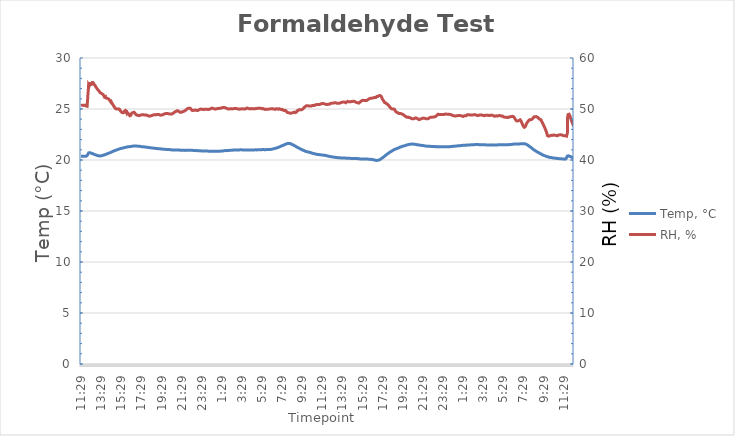
| Category | Temp, °C |
|---|---|
| 2021-06-14 11:29:58 | 20.365 |
| 2021-06-14 11:30:58 | 20.365 |
| 2021-06-14 11:31:58 | 20.341 |
| 2021-06-14 11:32:58 | 20.365 |
| 2021-06-14 11:33:58 | 20.365 |
| 2021-06-14 11:34:58 | 20.365 |
| 2021-06-14 11:35:58 | 20.365 |
| 2021-06-14 11:36:58 | 20.365 |
| 2021-06-14 11:37:58 | 20.365 |
| 2021-06-14 11:38:58 | 20.365 |
| 2021-06-14 11:39:58 | 20.365 |
| 2021-06-14 11:40:58 | 20.365 |
| 2021-06-14 11:41:58 | 20.365 |
| 2021-06-14 11:42:58 | 20.365 |
| 2021-06-14 11:43:58 | 20.365 |
| 2021-06-14 11:44:58 | 20.365 |
| 2021-06-14 11:45:58 | 20.365 |
| 2021-06-14 11:46:58 | 20.365 |
| 2021-06-14 11:47:58 | 20.365 |
| 2021-06-14 11:48:58 | 20.365 |
| 2021-06-14 11:49:58 | 20.365 |
| 2021-06-14 11:50:58 | 20.365 |
| 2021-06-14 11:51:58 | 20.365 |
| 2021-06-14 11:52:58 | 20.365 |
| 2021-06-14 11:53:58 | 20.365 |
| 2021-06-14 11:54:58 | 20.365 |
| 2021-06-14 11:55:58 | 20.365 |
| 2021-06-14 11:56:58 | 20.365 |
| 2021-06-14 11:57:58 | 20.365 |
| 2021-06-14 11:58:58 | 20.365 |
| 2021-06-14 11:59:58 | 20.365 |
| 2021-06-14 12:00:58 | 20.365 |
| 2021-06-14 12:01:58 | 20.365 |
| 2021-06-14 12:02:58 | 20.388 |
| 2021-06-14 12:03:58 | 20.388 |
| 2021-06-14 12:04:58 | 20.412 |
| 2021-06-14 12:05:58 | 20.436 |
| 2021-06-14 12:06:58 | 20.436 |
| 2021-06-14 12:07:58 | 20.46 |
| 2021-06-14 12:08:58 | 20.484 |
| 2021-06-14 12:09:58 | 20.531 |
| 2021-06-14 12:10:58 | 20.579 |
| 2021-06-14 12:11:58 | 20.603 |
| 2021-06-14 12:12:58 | 20.627 |
| 2021-06-14 12:13:58 | 20.674 |
| 2021-06-14 12:14:58 | 20.698 |
| 2021-06-14 12:15:58 | 20.722 |
| 2021-06-14 12:16:58 | 20.722 |
| 2021-06-14 12:17:58 | 20.746 |
| 2021-06-14 12:18:58 | 20.746 |
| 2021-06-14 12:19:58 | 20.746 |
| 2021-06-14 12:20:58 | 20.722 |
| 2021-06-14 12:21:58 | 20.722 |
| 2021-06-14 12:22:58 | 20.722 |
| 2021-06-14 12:23:58 | 20.722 |
| 2021-06-14 12:24:58 | 20.722 |
| 2021-06-14 12:25:58 | 20.698 |
| 2021-06-14 12:26:58 | 20.698 |
| 2021-06-14 12:27:58 | 20.698 |
| 2021-06-14 12:28:58 | 20.674 |
| 2021-06-14 12:29:58 | 20.674 |
| 2021-06-14 12:30:58 | 20.674 |
| 2021-06-14 12:31:58 | 20.65 |
| 2021-06-14 12:32:58 | 20.65 |
| 2021-06-14 12:33:58 | 20.65 |
| 2021-06-14 12:34:58 | 20.65 |
| 2021-06-14 12:35:58 | 20.627 |
| 2021-06-14 12:36:58 | 20.627 |
| 2021-06-14 12:37:58 | 20.627 |
| 2021-06-14 12:38:58 | 20.627 |
| 2021-06-14 12:39:58 | 20.603 |
| 2021-06-14 12:40:58 | 20.603 |
| 2021-06-14 12:41:58 | 20.579 |
| 2021-06-14 12:42:58 | 20.579 |
| 2021-06-14 12:43:58 | 20.579 |
| 2021-06-14 12:44:58 | 20.579 |
| 2021-06-14 12:45:58 | 20.555 |
| 2021-06-14 12:46:58 | 20.555 |
| 2021-06-14 12:47:58 | 20.555 |
| 2021-06-14 12:48:58 | 20.555 |
| 2021-06-14 12:49:58 | 20.531 |
| 2021-06-14 12:50:58 | 20.531 |
| 2021-06-14 12:51:58 | 20.531 |
| 2021-06-14 12:52:58 | 20.531 |
| 2021-06-14 12:53:58 | 20.507 |
| 2021-06-14 12:54:58 | 20.507 |
| 2021-06-14 12:55:58 | 20.507 |
| 2021-06-14 12:56:58 | 20.507 |
| 2021-06-14 12:57:58 | 20.484 |
| 2021-06-14 12:58:58 | 20.484 |
| 2021-06-14 12:59:58 | 20.484 |
| 2021-06-14 13:00:58 | 20.46 |
| 2021-06-14 13:01:58 | 20.46 |
| 2021-06-14 13:02:58 | 20.46 |
| 2021-06-14 13:03:58 | 20.46 |
| 2021-06-14 13:04:58 | 20.46 |
| 2021-06-14 13:05:58 | 20.436 |
| 2021-06-14 13:06:58 | 20.436 |
| 2021-06-14 13:07:58 | 20.436 |
| 2021-06-14 13:08:58 | 20.436 |
| 2021-06-14 13:09:58 | 20.436 |
| 2021-06-14 13:10:58 | 20.412 |
| 2021-06-14 13:11:58 | 20.412 |
| 2021-06-14 13:12:58 | 20.412 |
| 2021-06-14 13:13:58 | 20.412 |
| 2021-06-14 13:14:58 | 20.412 |
| 2021-06-14 13:15:58 | 20.412 |
| 2021-06-14 13:16:58 | 20.412 |
| 2021-06-14 13:17:58 | 20.412 |
| 2021-06-14 13:18:58 | 20.412 |
| 2021-06-14 13:19:58 | 20.412 |
| 2021-06-14 13:20:58 | 20.388 |
| 2021-06-14 13:21:58 | 20.388 |
| 2021-06-14 13:22:58 | 20.388 |
| 2021-06-14 13:23:58 | 20.388 |
| 2021-06-14 13:24:58 | 20.412 |
| 2021-06-14 13:25:58 | 20.412 |
| 2021-06-14 13:26:58 | 20.412 |
| 2021-06-14 13:27:58 | 20.412 |
| 2021-06-14 13:28:58 | 20.412 |
| 2021-06-14 13:29:58 | 20.412 |
| 2021-06-14 13:30:58 | 20.412 |
| 2021-06-14 13:31:58 | 20.412 |
| 2021-06-14 13:32:58 | 20.412 |
| 2021-06-14 13:33:58 | 20.436 |
| 2021-06-14 13:34:58 | 20.436 |
| 2021-06-14 13:35:58 | 20.436 |
| 2021-06-14 13:36:58 | 20.436 |
| 2021-06-14 13:37:58 | 20.436 |
| 2021-06-14 13:38:58 | 20.46 |
| 2021-06-14 13:39:58 | 20.46 |
| 2021-06-14 13:40:58 | 20.46 |
| 2021-06-14 13:41:58 | 20.46 |
| 2021-06-14 13:42:58 | 20.46 |
| 2021-06-14 13:43:58 | 20.484 |
| 2021-06-14 13:44:58 | 20.484 |
| 2021-06-14 13:45:58 | 20.484 |
| 2021-06-14 13:46:58 | 20.484 |
| 2021-06-14 13:47:58 | 20.507 |
| 2021-06-14 13:48:58 | 20.507 |
| 2021-06-14 13:49:58 | 20.507 |
| 2021-06-14 13:50:58 | 20.507 |
| 2021-06-14 13:51:58 | 20.507 |
| 2021-06-14 13:52:58 | 20.531 |
| 2021-06-14 13:53:58 | 20.531 |
| 2021-06-14 13:54:58 | 20.531 |
| 2021-06-14 13:55:58 | 20.531 |
| 2021-06-14 13:56:58 | 20.555 |
| 2021-06-14 13:57:58 | 20.555 |
| 2021-06-14 13:58:58 | 20.555 |
| 2021-06-14 13:59:58 | 20.555 |
| 2021-06-14 14:00:58 | 20.579 |
| 2021-06-14 14:01:58 | 20.579 |
| 2021-06-14 14:02:58 | 20.579 |
| 2021-06-14 14:03:58 | 20.603 |
| 2021-06-14 14:04:58 | 20.603 |
| 2021-06-14 14:05:58 | 20.603 |
| 2021-06-14 14:06:58 | 20.627 |
| 2021-06-14 14:07:58 | 20.627 |
| 2021-06-14 14:08:58 | 20.627 |
| 2021-06-14 14:09:58 | 20.627 |
| 2021-06-14 14:10:58 | 20.65 |
| 2021-06-14 14:11:58 | 20.65 |
| 2021-06-14 14:12:58 | 20.65 |
| 2021-06-14 14:13:58 | 20.674 |
| 2021-06-14 14:14:58 | 20.674 |
| 2021-06-14 14:15:58 | 20.674 |
| 2021-06-14 14:16:58 | 20.674 |
| 2021-06-14 14:17:58 | 20.674 |
| 2021-06-14 14:18:58 | 20.698 |
| 2021-06-14 14:19:58 | 20.698 |
| 2021-06-14 14:20:58 | 20.698 |
| 2021-06-14 14:21:58 | 20.722 |
| 2021-06-14 14:22:58 | 20.722 |
| 2021-06-14 14:23:58 | 20.722 |
| 2021-06-14 14:24:58 | 20.746 |
| 2021-06-14 14:25:58 | 20.746 |
| 2021-06-14 14:26:58 | 20.746 |
| 2021-06-14 14:27:58 | 20.746 |
| 2021-06-14 14:28:58 | 20.77 |
| 2021-06-14 14:29:58 | 20.77 |
| 2021-06-14 14:30:58 | 20.793 |
| 2021-06-14 14:31:58 | 20.793 |
| 2021-06-14 14:32:58 | 20.793 |
| 2021-06-14 14:33:58 | 20.793 |
| 2021-06-14 14:34:58 | 20.817 |
| 2021-06-14 14:35:58 | 20.817 |
| 2021-06-14 14:36:58 | 20.817 |
| 2021-06-14 14:37:58 | 20.841 |
| 2021-06-14 14:38:58 | 20.841 |
| 2021-06-14 14:39:58 | 20.841 |
| 2021-06-14 14:40:58 | 20.865 |
| 2021-06-14 14:41:58 | 20.865 |
| 2021-06-14 14:42:58 | 20.865 |
| 2021-06-14 14:43:58 | 20.865 |
| 2021-06-14 14:44:58 | 20.889 |
| 2021-06-14 14:45:58 | 20.889 |
| 2021-06-14 14:46:58 | 20.889 |
| 2021-06-14 14:47:58 | 20.889 |
| 2021-06-14 14:48:58 | 20.913 |
| 2021-06-14 14:49:58 | 20.889 |
| 2021-06-14 14:50:58 | 20.913 |
| 2021-06-14 14:51:58 | 20.936 |
| 2021-06-14 14:52:58 | 20.913 |
| 2021-06-14 14:53:58 | 20.936 |
| 2021-06-14 14:54:58 | 20.936 |
| 2021-06-14 14:55:58 | 20.936 |
| 2021-06-14 14:56:58 | 20.96 |
| 2021-06-14 14:57:58 | 20.96 |
| 2021-06-14 14:58:58 | 20.96 |
| 2021-06-14 14:59:58 | 20.96 |
| 2021-06-14 15:00:58 | 20.984 |
| 2021-06-14 15:01:58 | 20.984 |
| 2021-06-14 15:02:58 | 20.984 |
| 2021-06-14 15:03:58 | 21.008 |
| 2021-06-14 15:04:58 | 21.008 |
| 2021-06-14 15:05:58 | 21.008 |
| 2021-06-14 15:06:58 | 21.008 |
| 2021-06-14 15:07:58 | 21.032 |
| 2021-06-14 15:08:58 | 21.032 |
| 2021-06-14 15:09:58 | 21.032 |
| 2021-06-14 15:10:58 | 21.032 |
| 2021-06-14 15:11:58 | 21.032 |
| 2021-06-14 15:12:58 | 21.056 |
| 2021-06-14 15:13:58 | 21.056 |
| 2021-06-14 15:14:58 | 21.056 |
| 2021-06-14 15:15:58 | 21.079 |
| 2021-06-14 15:16:58 | 21.079 |
| 2021-06-14 15:17:58 | 21.079 |
| 2021-06-14 15:18:58 | 21.079 |
| 2021-06-14 15:19:58 | 21.103 |
| 2021-06-14 15:20:58 | 21.103 |
| 2021-06-14 15:21:58 | 21.103 |
| 2021-06-14 15:22:58 | 21.103 |
| 2021-06-14 15:23:58 | 21.127 |
| 2021-06-14 15:24:58 | 21.127 |
| 2021-06-14 15:25:58 | 21.127 |
| 2021-06-14 15:26:58 | 21.127 |
| 2021-06-14 15:27:58 | 21.127 |
| 2021-06-14 15:28:58 | 21.151 |
| 2021-06-14 15:29:58 | 21.151 |
| 2021-06-14 15:30:58 | 21.151 |
| 2021-06-14 15:31:58 | 21.151 |
| 2021-06-14 15:32:58 | 21.151 |
| 2021-06-14 15:33:58 | 21.151 |
| 2021-06-14 15:34:58 | 21.175 |
| 2021-06-14 15:35:58 | 21.175 |
| 2021-06-14 15:36:58 | 21.175 |
| 2021-06-14 15:37:58 | 21.175 |
| 2021-06-14 15:38:58 | 21.175 |
| 2021-06-14 15:39:58 | 21.199 |
| 2021-06-14 15:40:58 | 21.199 |
| 2021-06-14 15:41:58 | 21.199 |
| 2021-06-14 15:42:58 | 21.199 |
| 2021-06-14 15:43:58 | 21.199 |
| 2021-06-14 15:44:58 | 21.199 |
| 2021-06-14 15:45:58 | 21.223 |
| 2021-06-14 15:46:58 | 21.223 |
| 2021-06-14 15:47:58 | 21.223 |
| 2021-06-14 15:48:58 | 21.223 |
| 2021-06-14 15:49:58 | 21.223 |
| 2021-06-14 15:50:58 | 21.223 |
| 2021-06-14 15:51:58 | 21.223 |
| 2021-06-14 15:52:58 | 21.246 |
| 2021-06-14 15:53:58 | 21.246 |
| 2021-06-14 15:54:58 | 21.246 |
| 2021-06-14 15:55:58 | 21.246 |
| 2021-06-14 15:56:58 | 21.246 |
| 2021-06-14 15:57:58 | 21.246 |
| 2021-06-14 15:58:58 | 21.246 |
| 2021-06-14 15:59:58 | 21.27 |
| 2021-06-14 16:00:58 | 21.27 |
| 2021-06-14 16:01:58 | 21.27 |
| 2021-06-14 16:02:58 | 21.27 |
| 2021-06-14 16:03:58 | 21.27 |
| 2021-06-14 16:04:58 | 21.27 |
| 2021-06-14 16:05:58 | 21.27 |
| 2021-06-14 16:06:58 | 21.27 |
| 2021-06-14 16:07:58 | 21.27 |
| 2021-06-14 16:08:58 | 21.294 |
| 2021-06-14 16:09:58 | 21.294 |
| 2021-06-14 16:10:58 | 21.294 |
| 2021-06-14 16:11:58 | 21.294 |
| 2021-06-14 16:12:58 | 21.294 |
| 2021-06-14 16:13:58 | 21.294 |
| 2021-06-14 16:14:58 | 21.294 |
| 2021-06-14 16:15:58 | 21.294 |
| 2021-06-14 16:16:58 | 21.294 |
| 2021-06-14 16:17:58 | 21.294 |
| 2021-06-14 16:18:58 | 21.294 |
| 2021-06-14 16:19:58 | 21.294 |
| 2021-06-14 16:20:58 | 21.318 |
| 2021-06-14 16:21:58 | 21.318 |
| 2021-06-14 16:22:58 | 21.294 |
| 2021-06-14 16:23:58 | 21.318 |
| 2021-06-14 16:24:58 | 21.318 |
| 2021-06-14 16:25:58 | 21.318 |
| 2021-06-14 16:26:58 | 21.318 |
| 2021-06-14 16:27:58 | 21.318 |
| 2021-06-14 16:28:58 | 21.318 |
| 2021-06-14 16:29:58 | 21.318 |
| 2021-06-14 16:30:58 | 21.318 |
| 2021-06-14 16:31:58 | 21.318 |
| 2021-06-14 16:32:58 | 21.342 |
| 2021-06-14 16:33:58 | 21.342 |
| 2021-06-14 16:34:58 | 21.342 |
| 2021-06-14 16:35:58 | 21.342 |
| 2021-06-14 16:36:58 | 21.342 |
| 2021-06-14 16:37:58 | 21.342 |
| 2021-06-14 16:38:58 | 21.366 |
| 2021-06-14 16:39:58 | 21.366 |
| 2021-06-14 16:40:58 | 21.366 |
| 2021-06-14 16:41:58 | 21.366 |
| 2021-06-14 16:42:58 | 21.366 |
| 2021-06-14 16:43:58 | 21.366 |
| 2021-06-14 16:44:58 | 21.366 |
| 2021-06-14 16:45:58 | 21.366 |
| 2021-06-14 16:46:58 | 21.366 |
| 2021-06-14 16:47:58 | 21.366 |
| 2021-06-14 16:48:58 | 21.366 |
| 2021-06-14 16:49:58 | 21.366 |
| 2021-06-14 16:50:58 | 21.366 |
| 2021-06-14 16:51:58 | 21.366 |
| 2021-06-14 16:52:58 | 21.366 |
| 2021-06-14 16:53:58 | 21.366 |
| 2021-06-14 16:54:58 | 21.366 |
| 2021-06-14 16:55:58 | 21.366 |
| 2021-06-14 16:56:58 | 21.366 |
| 2021-06-14 16:57:58 | 21.366 |
| 2021-06-14 16:58:58 | 21.366 |
| 2021-06-14 16:59:58 | 21.366 |
| 2021-06-14 17:00:58 | 21.366 |
| 2021-06-14 17:01:58 | 21.366 |
| 2021-06-14 17:02:58 | 21.366 |
| 2021-06-14 17:03:58 | 21.366 |
| 2021-06-14 17:04:58 | 21.366 |
| 2021-06-14 17:05:58 | 21.366 |
| 2021-06-14 17:06:58 | 21.366 |
| 2021-06-14 17:07:58 | 21.366 |
| 2021-06-14 17:08:58 | 21.342 |
| 2021-06-14 17:09:58 | 21.342 |
| 2021-06-14 17:10:58 | 21.342 |
| 2021-06-14 17:11:58 | 21.342 |
| 2021-06-14 17:12:58 | 21.342 |
| 2021-06-14 17:13:58 | 21.342 |
| 2021-06-14 17:14:58 | 21.342 |
| 2021-06-14 17:15:58 | 21.342 |
| 2021-06-14 17:16:58 | 21.342 |
| 2021-06-14 17:17:58 | 21.342 |
| 2021-06-14 17:18:58 | 21.342 |
| 2021-06-14 17:19:58 | 21.342 |
| 2021-06-14 17:20:58 | 21.342 |
| 2021-06-14 17:21:58 | 21.318 |
| 2021-06-14 17:22:58 | 21.318 |
| 2021-06-14 17:23:58 | 21.318 |
| 2021-06-14 17:24:58 | 21.318 |
| 2021-06-14 17:25:58 | 21.318 |
| 2021-06-14 17:26:58 | 21.318 |
| 2021-06-14 17:27:58 | 21.318 |
| 2021-06-14 17:28:58 | 21.318 |
| 2021-06-14 17:29:58 | 21.318 |
| 2021-06-14 17:30:58 | 21.318 |
| 2021-06-14 17:31:58 | 21.318 |
| 2021-06-14 17:32:58 | 21.294 |
| 2021-06-14 17:33:58 | 21.318 |
| 2021-06-14 17:34:58 | 21.294 |
| 2021-06-14 17:35:58 | 21.294 |
| 2021-06-14 17:36:58 | 21.294 |
| 2021-06-14 17:37:58 | 21.294 |
| 2021-06-14 17:38:58 | 21.294 |
| 2021-06-14 17:39:58 | 21.294 |
| 2021-06-14 17:40:58 | 21.294 |
| 2021-06-14 17:41:58 | 21.294 |
| 2021-06-14 17:42:58 | 21.294 |
| 2021-06-14 17:43:58 | 21.294 |
| 2021-06-14 17:44:58 | 21.294 |
| 2021-06-14 17:45:58 | 21.27 |
| 2021-06-14 17:46:58 | 21.294 |
| 2021-06-14 17:47:58 | 21.27 |
| 2021-06-14 17:48:58 | 21.27 |
| 2021-06-14 17:49:58 | 21.27 |
| 2021-06-14 17:50:58 | 21.27 |
| 2021-06-14 17:51:58 | 21.27 |
| 2021-06-14 17:52:58 | 21.27 |
| 2021-06-14 17:53:58 | 21.27 |
| 2021-06-14 17:54:58 | 21.27 |
| 2021-06-14 17:55:58 | 21.246 |
| 2021-06-14 17:56:58 | 21.27 |
| 2021-06-14 17:57:58 | 21.246 |
| 2021-06-14 17:58:58 | 21.27 |
| 2021-06-14 17:59:58 | 21.246 |
| 2021-06-14 18:00:58 | 21.246 |
| 2021-06-14 18:01:58 | 21.246 |
| 2021-06-14 18:02:58 | 21.246 |
| 2021-06-14 18:03:58 | 21.246 |
| 2021-06-14 18:04:58 | 21.246 |
| 2021-06-14 18:05:58 | 21.223 |
| 2021-06-14 18:06:58 | 21.246 |
| 2021-06-14 18:07:58 | 21.246 |
| 2021-06-14 18:08:58 | 21.223 |
| 2021-06-14 18:09:58 | 21.223 |
| 2021-06-14 18:10:58 | 21.223 |
| 2021-06-14 18:11:58 | 21.223 |
| 2021-06-14 18:12:58 | 21.223 |
| 2021-06-14 18:13:58 | 21.223 |
| 2021-06-14 18:14:58 | 21.223 |
| 2021-06-14 18:15:58 | 21.223 |
| 2021-06-14 18:16:58 | 21.223 |
| 2021-06-14 18:17:58 | 21.199 |
| 2021-06-14 18:18:58 | 21.223 |
| 2021-06-14 18:19:58 | 21.199 |
| 2021-06-14 18:20:58 | 21.199 |
| 2021-06-14 18:21:58 | 21.199 |
| 2021-06-14 18:22:58 | 21.199 |
| 2021-06-14 18:23:58 | 21.199 |
| 2021-06-14 18:24:58 | 21.199 |
| 2021-06-14 18:25:58 | 21.199 |
| 2021-06-14 18:26:58 | 21.199 |
| 2021-06-14 18:27:58 | 21.175 |
| 2021-06-14 18:28:58 | 21.175 |
| 2021-06-14 18:29:58 | 21.199 |
| 2021-06-14 18:30:58 | 21.175 |
| 2021-06-14 18:31:58 | 21.175 |
| 2021-06-14 18:32:58 | 21.175 |
| 2021-06-14 18:33:58 | 21.175 |
| 2021-06-14 18:34:58 | 21.175 |
| 2021-06-14 18:35:58 | 21.175 |
| 2021-06-14 18:36:58 | 21.175 |
| 2021-06-14 18:37:58 | 21.175 |
| 2021-06-14 18:38:58 | 21.175 |
| 2021-06-14 18:39:58 | 21.151 |
| 2021-06-14 18:40:58 | 21.151 |
| 2021-06-14 18:41:58 | 21.151 |
| 2021-06-14 18:42:58 | 21.151 |
| 2021-06-14 18:43:58 | 21.151 |
| 2021-06-14 18:44:58 | 21.151 |
| 2021-06-14 18:45:58 | 21.151 |
| 2021-06-14 18:46:58 | 21.151 |
| 2021-06-14 18:47:58 | 21.151 |
| 2021-06-14 18:48:58 | 21.151 |
| 2021-06-14 18:49:58 | 21.151 |
| 2021-06-14 18:50:58 | 21.151 |
| 2021-06-14 18:51:58 | 21.151 |
| 2021-06-14 18:52:58 | 21.151 |
| 2021-06-14 18:53:58 | 21.127 |
| 2021-06-14 18:54:58 | 21.127 |
| 2021-06-14 18:55:58 | 21.127 |
| 2021-06-14 18:56:58 | 21.127 |
| 2021-06-14 18:57:58 | 21.127 |
| 2021-06-14 18:58:58 | 21.127 |
| 2021-06-14 18:59:58 | 21.127 |
| 2021-06-14 19:00:58 | 21.127 |
| 2021-06-14 19:01:58 | 21.127 |
| 2021-06-14 19:02:58 | 21.127 |
| 2021-06-14 19:03:58 | 21.127 |
| 2021-06-14 19:04:58 | 21.127 |
| 2021-06-14 19:05:58 | 21.103 |
| 2021-06-14 19:06:58 | 21.127 |
| 2021-06-14 19:07:58 | 21.103 |
| 2021-06-14 19:08:58 | 21.103 |
| 2021-06-14 19:09:58 | 21.103 |
| 2021-06-14 19:10:58 | 21.103 |
| 2021-06-14 19:11:58 | 21.103 |
| 2021-06-14 19:12:58 | 21.103 |
| 2021-06-14 19:13:58 | 21.103 |
| 2021-06-14 19:14:58 | 21.103 |
| 2021-06-14 19:15:58 | 21.103 |
| 2021-06-14 19:16:58 | 21.103 |
| 2021-06-14 19:17:58 | 21.103 |
| 2021-06-14 19:18:58 | 21.103 |
| 2021-06-14 19:19:58 | 21.079 |
| 2021-06-14 19:20:58 | 21.103 |
| 2021-06-14 19:21:58 | 21.079 |
| 2021-06-14 19:22:58 | 21.079 |
| 2021-06-14 19:23:58 | 21.079 |
| 2021-06-14 19:24:58 | 21.079 |
| 2021-06-14 19:25:58 | 21.079 |
| 2021-06-14 19:26:58 | 21.079 |
| 2021-06-14 19:27:58 | 21.079 |
| 2021-06-14 19:28:58 | 21.079 |
| 2021-06-14 19:29:58 | 21.079 |
| 2021-06-14 19:30:58 | 21.079 |
| 2021-06-14 19:31:58 | 21.079 |
| 2021-06-14 19:32:58 | 21.079 |
| 2021-06-14 19:33:58 | 21.056 |
| 2021-06-14 19:34:58 | 21.079 |
| 2021-06-14 19:35:58 | 21.056 |
| 2021-06-14 19:36:58 | 21.056 |
| 2021-06-14 19:37:58 | 21.056 |
| 2021-06-14 19:38:58 | 21.056 |
| 2021-06-14 19:39:58 | 21.056 |
| 2021-06-14 19:40:58 | 21.056 |
| 2021-06-14 19:41:58 | 21.056 |
| 2021-06-14 19:42:58 | 21.056 |
| 2021-06-14 19:43:58 | 21.056 |
| 2021-06-14 19:44:58 | 21.056 |
| 2021-06-14 19:45:58 | 21.056 |
| 2021-06-14 19:46:58 | 21.056 |
| 2021-06-14 19:47:58 | 21.056 |
| 2021-06-14 19:48:58 | 21.056 |
| 2021-06-14 19:49:58 | 21.056 |
| 2021-06-14 19:50:58 | 21.056 |
| 2021-06-14 19:51:58 | 21.032 |
| 2021-06-14 19:52:58 | 21.056 |
| 2021-06-14 19:53:58 | 21.056 |
| 2021-06-14 19:54:58 | 21.032 |
| 2021-06-14 19:55:58 | 21.032 |
| 2021-06-14 19:56:58 | 21.032 |
| 2021-06-14 19:57:58 | 21.032 |
| 2021-06-14 19:58:58 | 21.032 |
| 2021-06-14 19:59:58 | 21.032 |
| 2021-06-14 20:00:58 | 21.032 |
| 2021-06-14 20:01:58 | 21.032 |
| 2021-06-14 20:02:58 | 21.032 |
| 2021-06-14 20:03:58 | 21.032 |
| 2021-06-14 20:04:58 | 21.032 |
| 2021-06-14 20:05:58 | 21.032 |
| 2021-06-14 20:06:58 | 21.032 |
| 2021-06-14 20:07:58 | 21.032 |
| 2021-06-14 20:08:58 | 21.032 |
| 2021-06-14 20:09:58 | 21.032 |
| 2021-06-14 20:10:58 | 21.032 |
| 2021-06-14 20:11:58 | 21.032 |
| 2021-06-14 20:12:58 | 21.008 |
| 2021-06-14 20:13:58 | 21.032 |
| 2021-06-14 20:14:58 | 21.032 |
| 2021-06-14 20:15:58 | 21.008 |
| 2021-06-14 20:16:58 | 21.008 |
| 2021-06-14 20:17:58 | 21.032 |
| 2021-06-14 20:18:58 | 21.008 |
| 2021-06-14 20:19:58 | 21.008 |
| 2021-06-14 20:20:58 | 21.008 |
| 2021-06-14 20:21:58 | 21.008 |
| 2021-06-14 20:22:58 | 21.008 |
| 2021-06-14 20:23:58 | 21.008 |
| 2021-06-14 20:24:58 | 21.008 |
| 2021-06-14 20:25:58 | 21.008 |
| 2021-06-14 20:26:58 | 21.008 |
| 2021-06-14 20:27:58 | 21.008 |
| 2021-06-14 20:28:58 | 21.008 |
| 2021-06-14 20:29:58 | 21.008 |
| 2021-06-14 20:30:58 | 20.984 |
| 2021-06-14 20:31:58 | 21.008 |
| 2021-06-14 20:32:58 | 20.984 |
| 2021-06-14 20:33:58 | 20.984 |
| 2021-06-14 20:34:58 | 20.984 |
| 2021-06-14 20:35:58 | 20.984 |
| 2021-06-14 20:36:58 | 20.984 |
| 2021-06-14 20:37:58 | 20.984 |
| 2021-06-14 20:38:58 | 20.984 |
| 2021-06-14 20:39:58 | 20.984 |
| 2021-06-14 20:40:58 | 20.984 |
| 2021-06-14 20:41:58 | 20.984 |
| 2021-06-14 20:42:58 | 20.984 |
| 2021-06-14 20:43:58 | 20.984 |
| 2021-06-14 20:44:58 | 20.984 |
| 2021-06-14 20:45:58 | 20.984 |
| 2021-06-14 20:46:58 | 20.984 |
| 2021-06-14 20:47:58 | 20.984 |
| 2021-06-14 20:48:58 | 20.984 |
| 2021-06-14 20:49:58 | 20.984 |
| 2021-06-14 20:50:58 | 20.984 |
| 2021-06-14 20:51:58 | 20.984 |
| 2021-06-14 20:52:58 | 20.984 |
| 2021-06-14 20:53:58 | 20.984 |
| 2021-06-14 20:54:58 | 20.984 |
| 2021-06-14 20:55:58 | 20.984 |
| 2021-06-14 20:56:58 | 20.984 |
| 2021-06-14 20:57:58 | 20.984 |
| 2021-06-14 20:58:58 | 20.984 |
| 2021-06-14 20:59:58 | 20.984 |
| 2021-06-14 21:00:58 | 20.984 |
| 2021-06-14 21:01:58 | 20.984 |
| 2021-06-14 21:02:58 | 20.984 |
| 2021-06-14 21:03:58 | 20.984 |
| 2021-06-14 21:04:58 | 20.984 |
| 2021-06-14 21:05:58 | 20.984 |
| 2021-06-14 21:06:58 | 20.984 |
| 2021-06-14 21:07:58 | 20.984 |
| 2021-06-14 21:08:58 | 20.984 |
| 2021-06-14 21:09:58 | 20.96 |
| 2021-06-14 21:10:58 | 20.984 |
| 2021-06-14 21:11:58 | 20.984 |
| 2021-06-14 21:12:58 | 20.984 |
| 2021-06-14 21:13:58 | 20.984 |
| 2021-06-14 21:14:58 | 20.984 |
| 2021-06-14 21:15:58 | 20.984 |
| 2021-06-14 21:16:58 | 20.984 |
| 2021-06-14 21:17:58 | 20.984 |
| 2021-06-14 21:18:58 | 20.984 |
| 2021-06-14 21:19:58 | 20.96 |
| 2021-06-14 21:20:58 | 20.96 |
| 2021-06-14 21:21:58 | 20.96 |
| 2021-06-14 21:22:58 | 20.96 |
| 2021-06-14 21:23:58 | 20.96 |
| 2021-06-14 21:24:58 | 20.96 |
| 2021-06-14 21:25:58 | 20.96 |
| 2021-06-14 21:26:58 | 20.96 |
| 2021-06-14 21:27:58 | 20.96 |
| 2021-06-14 21:28:58 | 20.96 |
| 2021-06-14 21:29:58 | 20.96 |
| 2021-06-14 21:30:58 | 20.96 |
| 2021-06-14 21:31:58 | 20.96 |
| 2021-06-14 21:32:58 | 20.96 |
| 2021-06-14 21:33:58 | 20.96 |
| 2021-06-14 21:34:58 | 20.96 |
| 2021-06-14 21:35:58 | 20.96 |
| 2021-06-14 21:36:58 | 20.96 |
| 2021-06-14 21:37:58 | 20.96 |
| 2021-06-14 21:38:58 | 20.96 |
| 2021-06-14 21:39:58 | 20.96 |
| 2021-06-14 21:40:58 | 20.96 |
| 2021-06-14 21:41:58 | 20.96 |
| 2021-06-14 21:42:58 | 20.96 |
| 2021-06-14 21:43:58 | 20.96 |
| 2021-06-14 21:44:58 | 20.96 |
| 2021-06-14 21:45:58 | 20.96 |
| 2021-06-14 21:46:58 | 20.96 |
| 2021-06-14 21:47:58 | 20.96 |
| 2021-06-14 21:48:58 | 20.96 |
| 2021-06-14 21:49:58 | 20.96 |
| 2021-06-14 21:50:58 | 20.936 |
| 2021-06-14 21:51:58 | 20.96 |
| 2021-06-14 21:52:58 | 20.96 |
| 2021-06-14 21:53:58 | 20.96 |
| 2021-06-14 21:54:58 | 20.96 |
| 2021-06-14 21:55:58 | 20.96 |
| 2021-06-14 21:56:58 | 20.96 |
| 2021-06-14 21:57:58 | 20.96 |
| 2021-06-14 21:58:58 | 20.936 |
| 2021-06-14 21:59:58 | 20.96 |
| 2021-06-14 22:00:58 | 20.96 |
| 2021-06-14 22:01:58 | 20.96 |
| 2021-06-14 22:02:58 | 20.96 |
| 2021-06-14 22:03:58 | 20.96 |
| 2021-06-14 22:04:58 | 20.96 |
| 2021-06-14 22:05:58 | 20.96 |
| 2021-06-14 22:06:58 | 20.96 |
| 2021-06-14 22:07:58 | 20.96 |
| 2021-06-14 22:08:58 | 20.96 |
| 2021-06-14 22:09:58 | 20.96 |
| 2021-06-14 22:10:58 | 20.936 |
| 2021-06-14 22:11:58 | 20.96 |
| 2021-06-14 22:12:58 | 20.96 |
| 2021-06-14 22:13:58 | 20.96 |
| 2021-06-14 22:14:58 | 20.96 |
| 2021-06-14 22:15:58 | 20.96 |
| 2021-06-14 22:16:58 | 20.96 |
| 2021-06-14 22:17:58 | 20.96 |
| 2021-06-14 22:18:58 | 20.96 |
| 2021-06-14 22:19:58 | 20.96 |
| 2021-06-14 22:20:58 | 20.96 |
| 2021-06-14 22:21:58 | 20.96 |
| 2021-06-14 22:22:58 | 20.96 |
| 2021-06-14 22:23:58 | 20.96 |
| 2021-06-14 22:24:58 | 20.96 |
| 2021-06-14 22:25:58 | 20.96 |
| 2021-06-14 22:26:58 | 20.96 |
| 2021-06-14 22:27:58 | 20.96 |
| 2021-06-14 22:28:58 | 20.936 |
| 2021-06-14 22:29:58 | 20.936 |
| 2021-06-14 22:30:58 | 20.96 |
| 2021-06-14 22:31:58 | 20.96 |
| 2021-06-14 22:32:58 | 20.96 |
| 2021-06-14 22:33:58 | 20.936 |
| 2021-06-14 22:34:58 | 20.96 |
| 2021-06-14 22:35:58 | 20.936 |
| 2021-06-14 22:36:58 | 20.936 |
| 2021-06-14 22:37:58 | 20.936 |
| 2021-06-14 22:38:58 | 20.936 |
| 2021-06-14 22:39:58 | 20.936 |
| 2021-06-14 22:40:58 | 20.936 |
| 2021-06-14 22:41:58 | 20.936 |
| 2021-06-14 22:42:58 | 20.936 |
| 2021-06-14 22:43:58 | 20.936 |
| 2021-06-14 22:44:58 | 20.936 |
| 2021-06-14 22:45:58 | 20.936 |
| 2021-06-14 22:46:58 | 20.936 |
| 2021-06-14 22:47:58 | 20.936 |
| 2021-06-14 22:48:58 | 20.936 |
| 2021-06-14 22:49:58 | 20.936 |
| 2021-06-14 22:50:58 | 20.936 |
| 2021-06-14 22:51:58 | 20.936 |
| 2021-06-14 22:52:58 | 20.936 |
| 2021-06-14 22:53:58 | 20.913 |
| 2021-06-14 22:54:58 | 20.913 |
| 2021-06-14 22:55:58 | 20.913 |
| 2021-06-14 22:56:58 | 20.936 |
| 2021-06-14 22:57:58 | 20.913 |
| 2021-06-14 22:58:58 | 20.913 |
| 2021-06-14 22:59:58 | 20.913 |
| 2021-06-14 23:00:58 | 20.913 |
| 2021-06-14 23:01:58 | 20.913 |
| 2021-06-14 23:02:58 | 20.913 |
| 2021-06-14 23:03:58 | 20.913 |
| 2021-06-14 23:04:58 | 20.913 |
| 2021-06-14 23:05:58 | 20.913 |
| 2021-06-14 23:06:58 | 20.913 |
| 2021-06-14 23:07:58 | 20.913 |
| 2021-06-14 23:08:58 | 20.913 |
| 2021-06-14 23:09:58 | 20.913 |
| 2021-06-14 23:10:58 | 20.913 |
| 2021-06-14 23:11:58 | 20.913 |
| 2021-06-14 23:12:58 | 20.913 |
| 2021-06-14 23:13:58 | 20.913 |
| 2021-06-14 23:14:58 | 20.913 |
| 2021-06-14 23:15:58 | 20.913 |
| 2021-06-14 23:16:58 | 20.913 |
| 2021-06-14 23:17:58 | 20.913 |
| 2021-06-14 23:18:58 | 20.889 |
| 2021-06-14 23:19:58 | 20.913 |
| 2021-06-14 23:20:58 | 20.913 |
| 2021-06-14 23:21:58 | 20.913 |
| 2021-06-14 23:22:58 | 20.889 |
| 2021-06-14 23:23:58 | 20.889 |
| 2021-06-14 23:24:58 | 20.889 |
| 2021-06-14 23:25:58 | 20.889 |
| 2021-06-14 23:26:58 | 20.889 |
| 2021-06-14 23:27:58 | 20.889 |
| 2021-06-14 23:28:58 | 20.889 |
| 2021-06-14 23:29:58 | 20.889 |
| 2021-06-14 23:30:58 | 20.889 |
| 2021-06-14 23:31:58 | 20.889 |
| 2021-06-14 23:32:58 | 20.889 |
| 2021-06-14 23:33:58 | 20.889 |
| 2021-06-14 23:34:58 | 20.889 |
| 2021-06-14 23:35:58 | 20.889 |
| 2021-06-14 23:36:58 | 20.889 |
| 2021-06-14 23:37:58 | 20.889 |
| 2021-06-14 23:38:58 | 20.889 |
| 2021-06-14 23:39:58 | 20.889 |
| 2021-06-14 23:40:58 | 20.889 |
| 2021-06-14 23:41:58 | 20.889 |
| 2021-06-14 23:42:58 | 20.889 |
| 2021-06-14 23:43:58 | 20.889 |
| 2021-06-14 23:44:58 | 20.889 |
| 2021-06-14 23:45:58 | 20.889 |
| 2021-06-14 23:46:58 | 20.889 |
| 2021-06-14 23:47:58 | 20.889 |
| 2021-06-14 23:48:58 | 20.889 |
| 2021-06-14 23:49:58 | 20.889 |
| 2021-06-14 23:50:58 | 20.889 |
| 2021-06-14 23:51:58 | 20.889 |
| 2021-06-14 23:52:58 | 20.889 |
| 2021-06-14 23:53:58 | 20.889 |
| 2021-06-14 23:54:58 | 20.889 |
| 2021-06-14 23:55:58 | 20.865 |
| 2021-06-14 23:56:58 | 20.889 |
| 2021-06-14 23:57:58 | 20.889 |
| 2021-06-14 23:58:58 | 20.889 |
| 2021-06-14 23:59:58 | 20.889 |
| 2021-06-15 00:00:58 | 20.889 |
| 2021-06-15 00:01:58 | 20.889 |
| 2021-06-15 00:02:58 | 20.889 |
| 2021-06-15 00:03:58 | 20.889 |
| 2021-06-15 00:04:58 | 20.865 |
| 2021-06-15 00:05:58 | 20.889 |
| 2021-06-15 00:06:58 | 20.889 |
| 2021-06-15 00:07:58 | 20.865 |
| 2021-06-15 00:08:58 | 20.865 |
| 2021-06-15 00:09:58 | 20.865 |
| 2021-06-15 00:10:58 | 20.865 |
| 2021-06-15 00:11:58 | 20.865 |
| 2021-06-15 00:12:58 | 20.865 |
| 2021-06-15 00:13:58 | 20.865 |
| 2021-06-15 00:14:58 | 20.865 |
| 2021-06-15 00:15:58 | 20.865 |
| 2021-06-15 00:16:58 | 20.865 |
| 2021-06-15 00:17:58 | 20.865 |
| 2021-06-15 00:18:58 | 20.865 |
| 2021-06-15 00:19:58 | 20.865 |
| 2021-06-15 00:20:58 | 20.865 |
| 2021-06-15 00:21:58 | 20.889 |
| 2021-06-15 00:22:58 | 20.865 |
| 2021-06-15 00:23:58 | 20.865 |
| 2021-06-15 00:24:58 | 20.889 |
| 2021-06-15 00:25:58 | 20.865 |
| 2021-06-15 00:26:58 | 20.865 |
| 2021-06-15 00:27:58 | 20.865 |
| 2021-06-15 00:28:58 | 20.865 |
| 2021-06-15 00:29:58 | 20.865 |
| 2021-06-15 00:30:58 | 20.865 |
| 2021-06-15 00:31:58 | 20.889 |
| 2021-06-15 00:32:58 | 20.865 |
| 2021-06-15 00:33:58 | 20.865 |
| 2021-06-15 00:34:58 | 20.865 |
| 2021-06-15 00:35:58 | 20.865 |
| 2021-06-15 00:36:58 | 20.865 |
| 2021-06-15 00:37:58 | 20.865 |
| 2021-06-15 00:38:58 | 20.865 |
| 2021-06-15 00:39:58 | 20.865 |
| 2021-06-15 00:40:58 | 20.865 |
| 2021-06-15 00:41:58 | 20.865 |
| 2021-06-15 00:42:58 | 20.865 |
| 2021-06-15 00:43:58 | 20.865 |
| 2021-06-15 00:44:58 | 20.865 |
| 2021-06-15 00:45:58 | 20.865 |
| 2021-06-15 00:46:58 | 20.865 |
| 2021-06-15 00:47:58 | 20.865 |
| 2021-06-15 00:48:58 | 20.865 |
| 2021-06-15 00:49:58 | 20.865 |
| 2021-06-15 00:50:58 | 20.865 |
| 2021-06-15 00:51:58 | 20.865 |
| 2021-06-15 00:52:58 | 20.865 |
| 2021-06-15 00:53:58 | 20.865 |
| 2021-06-15 00:54:58 | 20.865 |
| 2021-06-15 00:55:58 | 20.865 |
| 2021-06-15 00:56:58 | 20.865 |
| 2021-06-15 00:57:58 | 20.841 |
| 2021-06-15 00:58:58 | 20.865 |
| 2021-06-15 00:59:58 | 20.865 |
| 2021-06-15 01:00:58 | 20.841 |
| 2021-06-15 01:01:58 | 20.865 |
| 2021-06-15 01:02:58 | 20.865 |
| 2021-06-15 01:03:58 | 20.865 |
| 2021-06-15 01:04:58 | 20.865 |
| 2021-06-15 01:05:58 | 20.865 |
| 2021-06-15 01:06:58 | 20.865 |
| 2021-06-15 01:07:58 | 20.865 |
| 2021-06-15 01:08:58 | 20.865 |
| 2021-06-15 01:09:58 | 20.865 |
| 2021-06-15 01:10:58 | 20.865 |
| 2021-06-15 01:11:58 | 20.865 |
| 2021-06-15 01:12:58 | 20.865 |
| 2021-06-15 01:13:58 | 20.865 |
| 2021-06-15 01:14:58 | 20.865 |
| 2021-06-15 01:15:58 | 20.865 |
| 2021-06-15 01:16:58 | 20.865 |
| 2021-06-15 01:17:58 | 20.865 |
| 2021-06-15 01:18:58 | 20.865 |
| 2021-06-15 01:19:58 | 20.865 |
| 2021-06-15 01:20:58 | 20.865 |
| 2021-06-15 01:21:58 | 20.865 |
| 2021-06-15 01:22:58 | 20.865 |
| 2021-06-15 01:23:58 | 20.865 |
| 2021-06-15 01:24:58 | 20.865 |
| 2021-06-15 01:25:58 | 20.889 |
| 2021-06-15 01:26:58 | 20.889 |
| 2021-06-15 01:27:58 | 20.889 |
| 2021-06-15 01:28:58 | 20.889 |
| 2021-06-15 01:29:58 | 20.889 |
| 2021-06-15 01:30:58 | 20.889 |
| 2021-06-15 01:31:58 | 20.889 |
| 2021-06-15 01:32:58 | 20.889 |
| 2021-06-15 01:33:58 | 20.889 |
| 2021-06-15 01:34:58 | 20.913 |
| 2021-06-15 01:35:58 | 20.889 |
| 2021-06-15 01:36:58 | 20.913 |
| 2021-06-15 01:37:58 | 20.889 |
| 2021-06-15 01:38:58 | 20.889 |
| 2021-06-15 01:39:58 | 20.889 |
| 2021-06-15 01:40:58 | 20.913 |
| 2021-06-15 01:41:58 | 20.913 |
| 2021-06-15 01:42:58 | 20.913 |
| 2021-06-15 01:43:58 | 20.913 |
| 2021-06-15 01:44:58 | 20.913 |
| 2021-06-15 01:45:58 | 20.913 |
| 2021-06-15 01:46:58 | 20.913 |
| 2021-06-15 01:47:58 | 20.913 |
| 2021-06-15 01:48:58 | 20.913 |
| 2021-06-15 01:49:58 | 20.913 |
| 2021-06-15 01:50:58 | 20.936 |
| 2021-06-15 01:51:58 | 20.913 |
| 2021-06-15 01:52:58 | 20.913 |
| 2021-06-15 01:53:58 | 20.936 |
| 2021-06-15 01:54:58 | 20.913 |
| 2021-06-15 01:55:58 | 20.936 |
| 2021-06-15 01:56:58 | 20.913 |
| 2021-06-15 01:57:58 | 20.936 |
| 2021-06-15 01:58:58 | 20.936 |
| 2021-06-15 01:59:58 | 20.936 |
| 2021-06-15 02:00:58 | 20.936 |
| 2021-06-15 02:01:58 | 20.936 |
| 2021-06-15 02:02:58 | 20.936 |
| 2021-06-15 02:03:58 | 20.936 |
| 2021-06-15 02:04:58 | 20.936 |
| 2021-06-15 02:05:58 | 20.936 |
| 2021-06-15 02:06:58 | 20.96 |
| 2021-06-15 02:07:58 | 20.936 |
| 2021-06-15 02:08:58 | 20.936 |
| 2021-06-15 02:09:58 | 20.936 |
| 2021-06-15 02:10:58 | 20.936 |
| 2021-06-15 02:11:58 | 20.936 |
| 2021-06-15 02:12:58 | 20.96 |
| 2021-06-15 02:13:58 | 20.936 |
| 2021-06-15 02:14:58 | 20.936 |
| 2021-06-15 02:15:58 | 20.936 |
| 2021-06-15 02:16:58 | 20.96 |
| 2021-06-15 02:17:58 | 20.96 |
| 2021-06-15 02:18:58 | 20.96 |
| 2021-06-15 02:19:58 | 20.96 |
| 2021-06-15 02:20:58 | 20.96 |
| 2021-06-15 02:21:58 | 20.96 |
| 2021-06-15 02:22:58 | 20.96 |
| 2021-06-15 02:23:58 | 20.96 |
| 2021-06-15 02:24:58 | 20.96 |
| 2021-06-15 02:25:58 | 20.96 |
| 2021-06-15 02:26:58 | 20.96 |
| 2021-06-15 02:27:58 | 20.96 |
| 2021-06-15 02:28:58 | 20.96 |
| 2021-06-15 02:29:58 | 20.96 |
| 2021-06-15 02:30:58 | 20.96 |
| 2021-06-15 02:31:58 | 20.96 |
| 2021-06-15 02:32:58 | 20.96 |
| 2021-06-15 02:33:58 | 20.96 |
| 2021-06-15 02:34:58 | 20.96 |
| 2021-06-15 02:35:58 | 20.96 |
| 2021-06-15 02:36:58 | 20.984 |
| 2021-06-15 02:37:58 | 20.96 |
| 2021-06-15 02:38:58 | 20.984 |
| 2021-06-15 02:39:58 | 20.96 |
| 2021-06-15 02:40:58 | 20.984 |
| 2021-06-15 02:41:58 | 20.984 |
| 2021-06-15 02:42:58 | 20.984 |
| 2021-06-15 02:43:58 | 20.984 |
| 2021-06-15 02:44:58 | 20.984 |
| 2021-06-15 02:45:58 | 20.984 |
| 2021-06-15 02:46:58 | 20.984 |
| 2021-06-15 02:47:58 | 20.984 |
| 2021-06-15 02:48:58 | 20.984 |
| 2021-06-15 02:49:58 | 20.984 |
| 2021-06-15 02:50:58 | 20.984 |
| 2021-06-15 02:51:58 | 21.008 |
| 2021-06-15 02:52:58 | 20.984 |
| 2021-06-15 02:53:58 | 20.984 |
| 2021-06-15 02:54:58 | 20.984 |
| 2021-06-15 02:55:58 | 20.984 |
| 2021-06-15 02:56:58 | 20.984 |
| 2021-06-15 02:57:58 | 20.984 |
| 2021-06-15 02:58:58 | 20.984 |
| 2021-06-15 02:59:58 | 20.984 |
| 2021-06-15 03:00:58 | 20.984 |
| 2021-06-15 03:01:58 | 20.984 |
| 2021-06-15 03:02:58 | 20.984 |
| 2021-06-15 03:03:58 | 20.984 |
| 2021-06-15 03:04:58 | 20.984 |
| 2021-06-15 03:05:58 | 20.984 |
| 2021-06-15 03:06:58 | 20.984 |
| 2021-06-15 03:07:58 | 20.984 |
| 2021-06-15 03:08:58 | 20.984 |
| 2021-06-15 03:09:58 | 20.984 |
| 2021-06-15 03:10:58 | 21.008 |
| 2021-06-15 03:11:58 | 20.984 |
| 2021-06-15 03:12:58 | 20.984 |
| 2021-06-15 03:13:58 | 20.984 |
| 2021-06-15 03:14:58 | 20.984 |
| 2021-06-15 03:15:58 | 20.984 |
| 2021-06-15 03:16:58 | 20.984 |
| 2021-06-15 03:17:58 | 20.984 |
| 2021-06-15 03:18:58 | 20.984 |
| 2021-06-15 03:19:58 | 20.984 |
| 2021-06-15 03:20:58 | 21.008 |
| 2021-06-15 03:21:58 | 20.984 |
| 2021-06-15 03:22:58 | 21.008 |
| 2021-06-15 03:23:58 | 21.008 |
| 2021-06-15 03:24:58 | 20.984 |
| 2021-06-15 03:25:58 | 21.008 |
| 2021-06-15 03:26:58 | 21.008 |
| 2021-06-15 03:27:58 | 21.008 |
| 2021-06-15 03:28:58 | 20.984 |
| 2021-06-15 03:29:58 | 21.008 |
| 2021-06-15 03:30:58 | 20.984 |
| 2021-06-15 03:31:58 | 20.984 |
| 2021-06-15 03:32:58 | 20.984 |
| 2021-06-15 03:33:58 | 20.984 |
| 2021-06-15 03:34:58 | 20.984 |
| 2021-06-15 03:35:58 | 20.984 |
| 2021-06-15 03:36:58 | 21.008 |
| 2021-06-15 03:37:58 | 21.008 |
| 2021-06-15 03:38:58 | 20.984 |
| 2021-06-15 03:39:58 | 20.984 |
| 2021-06-15 03:40:58 | 21.008 |
| 2021-06-15 03:41:58 | 21.008 |
| 2021-06-15 03:42:58 | 20.984 |
| 2021-06-15 03:43:58 | 20.984 |
| 2021-06-15 03:44:58 | 20.984 |
| 2021-06-15 03:45:58 | 20.984 |
| 2021-06-15 03:46:58 | 20.984 |
| 2021-06-15 03:47:58 | 20.984 |
| 2021-06-15 03:48:58 | 21.008 |
| 2021-06-15 03:49:58 | 20.984 |
| 2021-06-15 03:50:58 | 20.984 |
| 2021-06-15 03:51:58 | 20.984 |
| 2021-06-15 03:52:58 | 20.984 |
| 2021-06-15 03:53:58 | 20.984 |
| 2021-06-15 03:54:58 | 20.984 |
| 2021-06-15 03:55:58 | 20.984 |
| 2021-06-15 03:56:58 | 20.984 |
| 2021-06-15 03:57:58 | 20.984 |
| 2021-06-15 03:58:58 | 20.984 |
| 2021-06-15 03:59:58 | 20.984 |
| 2021-06-15 04:00:58 | 20.984 |
| 2021-06-15 04:01:58 | 20.984 |
| 2021-06-15 04:02:58 | 20.984 |
| 2021-06-15 04:03:58 | 20.984 |
| 2021-06-15 04:04:58 | 20.984 |
| 2021-06-15 04:05:58 | 20.984 |
| 2021-06-15 04:06:58 | 20.984 |
| 2021-06-15 04:07:58 | 20.984 |
| 2021-06-15 04:08:58 | 20.984 |
| 2021-06-15 04:09:58 | 20.984 |
| 2021-06-15 04:10:58 | 20.984 |
| 2021-06-15 04:11:58 | 20.984 |
| 2021-06-15 04:12:58 | 20.984 |
| 2021-06-15 04:13:58 | 20.984 |
| 2021-06-15 04:14:58 | 20.984 |
| 2021-06-15 04:15:58 | 20.984 |
| 2021-06-15 04:16:58 | 20.984 |
| 2021-06-15 04:17:58 | 20.984 |
| 2021-06-15 04:18:58 | 20.984 |
| 2021-06-15 04:19:58 | 20.984 |
| 2021-06-15 04:20:58 | 20.984 |
| 2021-06-15 04:21:58 | 20.984 |
| 2021-06-15 04:22:58 | 20.984 |
| 2021-06-15 04:23:58 | 20.984 |
| 2021-06-15 04:24:58 | 20.984 |
| 2021-06-15 04:25:58 | 20.984 |
| 2021-06-15 04:26:58 | 20.984 |
| 2021-06-15 04:27:58 | 20.984 |
| 2021-06-15 04:28:58 | 20.984 |
| 2021-06-15 04:29:58 | 20.984 |
| 2021-06-15 04:30:58 | 20.984 |
| 2021-06-15 04:31:58 | 20.984 |
| 2021-06-15 04:32:58 | 20.984 |
| 2021-06-15 04:33:58 | 20.984 |
| 2021-06-15 04:34:58 | 20.984 |
| 2021-06-15 04:35:58 | 20.984 |
| 2021-06-15 04:36:58 | 20.984 |
| 2021-06-15 04:37:58 | 20.984 |
| 2021-06-15 04:38:58 | 20.984 |
| 2021-06-15 04:39:58 | 20.984 |
| 2021-06-15 04:40:58 | 20.984 |
| 2021-06-15 04:41:58 | 20.984 |
| 2021-06-15 04:42:58 | 20.984 |
| 2021-06-15 04:43:58 | 20.984 |
| 2021-06-15 04:44:58 | 20.984 |
| 2021-06-15 04:45:58 | 20.984 |
| 2021-06-15 04:46:58 | 20.984 |
| 2021-06-15 04:47:58 | 20.984 |
| 2021-06-15 04:48:58 | 20.984 |
| 2021-06-15 04:49:58 | 20.984 |
| 2021-06-15 04:50:58 | 21.008 |
| 2021-06-15 04:51:58 | 20.984 |
| 2021-06-15 04:52:58 | 20.984 |
| 2021-06-15 04:53:58 | 20.984 |
| 2021-06-15 04:54:58 | 21.008 |
| 2021-06-15 04:55:58 | 20.984 |
| 2021-06-15 04:56:58 | 20.984 |
| 2021-06-15 04:57:58 | 20.984 |
| 2021-06-15 04:58:58 | 20.984 |
| 2021-06-15 04:59:58 | 20.984 |
| 2021-06-15 05:00:58 | 21.008 |
| 2021-06-15 05:01:58 | 20.984 |
| 2021-06-15 05:02:58 | 21.008 |
| 2021-06-15 05:03:58 | 21.008 |
| 2021-06-15 05:04:58 | 21.008 |
| 2021-06-15 05:05:58 | 21.008 |
| 2021-06-15 05:06:58 | 21.008 |
| 2021-06-15 05:07:58 | 21.008 |
| 2021-06-15 05:08:58 | 21.008 |
| 2021-06-15 05:09:58 | 21.008 |
| 2021-06-15 05:10:58 | 21.008 |
| 2021-06-15 05:11:58 | 21.008 |
| 2021-06-15 05:12:58 | 21.008 |
| 2021-06-15 05:13:58 | 21.008 |
| 2021-06-15 05:14:58 | 21.008 |
| 2021-06-15 05:15:58 | 21.008 |
| 2021-06-15 05:16:58 | 21.008 |
| 2021-06-15 05:17:58 | 21.008 |
| 2021-06-15 05:18:58 | 21.008 |
| 2021-06-15 05:19:58 | 21.008 |
| 2021-06-15 05:20:58 | 21.008 |
| 2021-06-15 05:21:58 | 21.008 |
| 2021-06-15 05:22:58 | 21.008 |
| 2021-06-15 05:23:58 | 21.032 |
| 2021-06-15 05:24:58 | 21.008 |
| 2021-06-15 05:25:58 | 21.008 |
| 2021-06-15 05:26:58 | 21.008 |
| 2021-06-15 05:27:58 | 21.008 |
| 2021-06-15 05:28:58 | 21.008 |
| 2021-06-15 05:29:58 | 21.008 |
| 2021-06-15 05:30:58 | 21.008 |
| 2021-06-15 05:31:58 | 21.008 |
| 2021-06-15 05:32:58 | 21.032 |
| 2021-06-15 05:33:58 | 21.008 |
| 2021-06-15 05:34:58 | 21.008 |
| 2021-06-15 05:35:58 | 21.008 |
| 2021-06-15 05:36:58 | 21.008 |
| 2021-06-15 05:37:58 | 21.008 |
| 2021-06-15 05:38:58 | 21.032 |
| 2021-06-15 05:39:58 | 21.032 |
| 2021-06-15 05:40:58 | 21.032 |
| 2021-06-15 05:41:58 | 21.032 |
| 2021-06-15 05:42:58 | 21.032 |
| 2021-06-15 05:43:58 | 21.032 |
| 2021-06-15 05:44:58 | 21.008 |
| 2021-06-15 05:45:58 | 21.008 |
| 2021-06-15 05:46:58 | 21.008 |
| 2021-06-15 05:47:58 | 21.032 |
| 2021-06-15 05:48:58 | 21.008 |
| 2021-06-15 05:49:58 | 21.032 |
| 2021-06-15 05:50:58 | 21.008 |
| 2021-06-15 05:51:58 | 21.008 |
| 2021-06-15 05:52:58 | 21.032 |
| 2021-06-15 05:53:58 | 21.032 |
| 2021-06-15 05:54:58 | 21.032 |
| 2021-06-15 05:55:58 | 21.032 |
| 2021-06-15 05:56:58 | 21.032 |
| 2021-06-15 05:57:58 | 21.032 |
| 2021-06-15 05:58:58 | 21.032 |
| 2021-06-15 05:59:58 | 21.008 |
| 2021-06-15 06:00:58 | 21.032 |
| 2021-06-15 06:01:58 | 21.032 |
| 2021-06-15 06:02:58 | 21.032 |
| 2021-06-15 06:03:58 | 21.032 |
| 2021-06-15 06:04:58 | 21.032 |
| 2021-06-15 06:05:58 | 21.032 |
| 2021-06-15 06:06:58 | 21.032 |
| 2021-06-15 06:07:58 | 21.032 |
| 2021-06-15 06:08:58 | 21.032 |
| 2021-06-15 06:09:58 | 21.032 |
| 2021-06-15 06:10:58 | 21.032 |
| 2021-06-15 06:11:58 | 21.032 |
| 2021-06-15 06:12:58 | 21.032 |
| 2021-06-15 06:13:58 | 21.032 |
| 2021-06-15 06:14:58 | 21.032 |
| 2021-06-15 06:15:58 | 21.032 |
| 2021-06-15 06:16:58 | 21.032 |
| 2021-06-15 06:17:58 | 21.032 |
| 2021-06-15 06:18:58 | 21.032 |
| 2021-06-15 06:19:58 | 21.032 |
| 2021-06-15 06:20:58 | 21.032 |
| 2021-06-15 06:21:58 | 21.032 |
| 2021-06-15 06:22:58 | 21.032 |
| 2021-06-15 06:23:58 | 21.032 |
| 2021-06-15 06:24:58 | 21.056 |
| 2021-06-15 06:25:58 | 21.056 |
| 2021-06-15 06:26:58 | 21.056 |
| 2021-06-15 06:27:58 | 21.056 |
| 2021-06-15 06:28:58 | 21.056 |
| 2021-06-15 06:29:58 | 21.056 |
| 2021-06-15 06:30:58 | 21.056 |
| 2021-06-15 06:31:58 | 21.079 |
| 2021-06-15 06:32:58 | 21.079 |
| 2021-06-15 06:33:58 | 21.079 |
| 2021-06-15 06:34:58 | 21.079 |
| 2021-06-15 06:35:58 | 21.079 |
| 2021-06-15 06:36:58 | 21.079 |
| 2021-06-15 06:37:58 | 21.079 |
| 2021-06-15 06:38:58 | 21.103 |
| 2021-06-15 06:39:58 | 21.103 |
| 2021-06-15 06:40:58 | 21.103 |
| 2021-06-15 06:41:58 | 21.103 |
| 2021-06-15 06:42:58 | 21.103 |
| 2021-06-15 06:43:58 | 21.127 |
| 2021-06-15 06:44:58 | 21.127 |
| 2021-06-15 06:45:58 | 21.127 |
| 2021-06-15 06:46:58 | 21.127 |
| 2021-06-15 06:47:58 | 21.127 |
| 2021-06-15 06:48:58 | 21.151 |
| 2021-06-15 06:49:58 | 21.151 |
| 2021-06-15 06:50:58 | 21.151 |
| 2021-06-15 06:51:58 | 21.151 |
| 2021-06-15 06:52:58 | 21.151 |
| 2021-06-15 06:53:58 | 21.175 |
| 2021-06-15 06:54:58 | 21.175 |
| 2021-06-15 06:55:58 | 21.175 |
| 2021-06-15 06:56:58 | 21.175 |
| 2021-06-15 06:57:58 | 21.199 |
| 2021-06-15 06:58:58 | 21.199 |
| 2021-06-15 06:59:58 | 21.199 |
| 2021-06-15 07:00:58 | 21.223 |
| 2021-06-15 07:01:58 | 21.223 |
| 2021-06-15 07:02:58 | 21.223 |
| 2021-06-15 07:03:58 | 21.246 |
| 2021-06-15 07:04:58 | 21.223 |
| 2021-06-15 07:05:58 | 21.246 |
| 2021-06-15 07:06:58 | 21.246 |
| 2021-06-15 07:07:58 | 21.246 |
| 2021-06-15 07:08:58 | 21.246 |
| 2021-06-15 07:09:58 | 21.27 |
| 2021-06-15 07:10:58 | 21.27 |
| 2021-06-15 07:11:58 | 21.27 |
| 2021-06-15 07:12:58 | 21.294 |
| 2021-06-15 07:13:58 | 21.294 |
| 2021-06-15 07:14:58 | 21.294 |
| 2021-06-15 07:15:58 | 21.294 |
| 2021-06-15 07:16:58 | 21.318 |
| 2021-06-15 07:17:58 | 21.318 |
| 2021-06-15 07:18:58 | 21.318 |
| 2021-06-15 07:19:58 | 21.318 |
| 2021-06-15 07:20:58 | 21.342 |
| 2021-06-15 07:21:58 | 21.342 |
| 2021-06-15 07:22:58 | 21.342 |
| 2021-06-15 07:23:58 | 21.366 |
| 2021-06-15 07:24:58 | 21.366 |
| 2021-06-15 07:25:58 | 21.366 |
| 2021-06-15 07:26:58 | 21.39 |
| 2021-06-15 07:27:58 | 21.39 |
| 2021-06-15 07:28:58 | 21.39 |
| 2021-06-15 07:29:58 | 21.39 |
| 2021-06-15 07:30:58 | 21.413 |
| 2021-06-15 07:31:58 | 21.413 |
| 2021-06-15 07:32:58 | 21.413 |
| 2021-06-15 07:33:58 | 21.437 |
| 2021-06-15 07:34:58 | 21.437 |
| 2021-06-15 07:35:58 | 21.437 |
| 2021-06-15 07:36:58 | 21.461 |
| 2021-06-15 07:37:58 | 21.461 |
| 2021-06-15 07:38:58 | 21.461 |
| 2021-06-15 07:39:58 | 21.461 |
| 2021-06-15 07:40:58 | 21.485 |
| 2021-06-15 07:41:58 | 21.485 |
| 2021-06-15 07:42:58 | 21.509 |
| 2021-06-15 07:43:58 | 21.509 |
| 2021-06-15 07:44:58 | 21.509 |
| 2021-06-15 07:45:58 | 21.509 |
| 2021-06-15 07:46:58 | 21.509 |
| 2021-06-15 07:47:58 | 21.533 |
| 2021-06-15 07:48:58 | 21.533 |
| 2021-06-15 07:49:58 | 21.557 |
| 2021-06-15 07:50:58 | 21.557 |
| 2021-06-15 07:51:58 | 21.557 |
| 2021-06-15 07:52:58 | 21.557 |
| 2021-06-15 07:53:58 | 21.581 |
| 2021-06-15 07:54:58 | 21.581 |
| 2021-06-15 07:55:58 | 21.581 |
| 2021-06-15 07:56:58 | 21.581 |
| 2021-06-15 07:57:58 | 21.604 |
| 2021-06-15 07:58:58 | 21.604 |
| 2021-06-15 07:59:58 | 21.604 |
| 2021-06-15 08:00:58 | 21.604 |
| 2021-06-15 08:01:58 | 21.604 |
| 2021-06-15 08:02:58 | 21.628 |
| 2021-06-15 08:03:58 | 21.628 |
| 2021-06-15 08:04:58 | 21.628 |
| 2021-06-15 08:05:58 | 21.628 |
| 2021-06-15 08:06:58 | 21.628 |
| 2021-06-15 08:07:58 | 21.628 |
| 2021-06-15 08:08:58 | 21.628 |
| 2021-06-15 08:09:58 | 21.628 |
| 2021-06-15 08:10:58 | 21.628 |
| 2021-06-15 08:11:58 | 21.628 |
| 2021-06-15 08:12:58 | 21.628 |
| 2021-06-15 08:13:58 | 21.604 |
| 2021-06-15 08:14:58 | 21.628 |
| 2021-06-15 08:15:58 | 21.604 |
| 2021-06-15 08:16:58 | 21.604 |
| 2021-06-15 08:17:58 | 21.604 |
| 2021-06-15 08:18:58 | 21.604 |
| 2021-06-15 08:19:58 | 21.581 |
| 2021-06-15 08:20:58 | 21.581 |
| 2021-06-15 08:21:58 | 21.581 |
| 2021-06-15 08:22:58 | 21.581 |
| 2021-06-15 08:23:58 | 21.581 |
| 2021-06-15 08:24:58 | 21.557 |
| 2021-06-15 08:25:58 | 21.557 |
| 2021-06-15 08:26:58 | 21.557 |
| 2021-06-15 08:27:58 | 21.533 |
| 2021-06-15 08:28:58 | 21.533 |
| 2021-06-15 08:29:58 | 21.509 |
| 2021-06-15 08:30:58 | 21.509 |
| 2021-06-15 08:31:58 | 21.509 |
| 2021-06-15 08:32:58 | 21.485 |
| 2021-06-15 08:33:58 | 21.485 |
| 2021-06-15 08:34:58 | 21.485 |
| 2021-06-15 08:35:58 | 21.461 |
| 2021-06-15 08:36:58 | 21.461 |
| 2021-06-15 08:37:58 | 21.461 |
| 2021-06-15 08:38:58 | 21.437 |
| 2021-06-15 08:39:58 | 21.437 |
| 2021-06-15 08:40:58 | 21.437 |
| 2021-06-15 08:41:58 | 21.413 |
| 2021-06-15 08:42:58 | 21.413 |
| 2021-06-15 08:43:58 | 21.39 |
| 2021-06-15 08:44:58 | 21.39 |
| 2021-06-15 08:45:58 | 21.39 |
| 2021-06-15 08:46:58 | 21.366 |
| 2021-06-15 08:47:58 | 21.366 |
| 2021-06-15 08:48:58 | 21.342 |
| 2021-06-15 08:49:58 | 21.318 |
| 2021-06-15 08:50:58 | 21.342 |
| 2021-06-15 08:51:58 | 21.318 |
| 2021-06-15 08:52:58 | 21.318 |
| 2021-06-15 08:53:58 | 21.294 |
| 2021-06-15 08:54:58 | 21.294 |
| 2021-06-15 08:55:58 | 21.294 |
| 2021-06-15 08:56:58 | 21.27 |
| 2021-06-15 08:57:58 | 21.27 |
| 2021-06-15 08:58:58 | 21.27 |
| 2021-06-15 08:59:58 | 21.27 |
| 2021-06-15 09:00:58 | 21.246 |
| 2021-06-15 09:01:58 | 21.246 |
| 2021-06-15 09:02:58 | 21.223 |
| 2021-06-15 09:03:58 | 21.223 |
| 2021-06-15 09:04:58 | 21.223 |
| 2021-06-15 09:05:58 | 21.199 |
| 2021-06-15 09:06:58 | 21.199 |
| 2021-06-15 09:07:58 | 21.199 |
| 2021-06-15 09:08:58 | 21.175 |
| 2021-06-15 09:09:58 | 21.175 |
| 2021-06-15 09:10:58 | 21.151 |
| 2021-06-15 09:11:58 | 21.151 |
| 2021-06-15 09:12:58 | 21.151 |
| 2021-06-15 09:13:58 | 21.127 |
| 2021-06-15 09:14:58 | 21.127 |
| 2021-06-15 09:15:58 | 21.127 |
| 2021-06-15 09:16:58 | 21.103 |
| 2021-06-15 09:17:58 | 21.103 |
| 2021-06-15 09:18:58 | 21.103 |
| 2021-06-15 09:19:58 | 21.079 |
| 2021-06-15 09:20:58 | 21.056 |
| 2021-06-15 09:21:58 | 21.056 |
| 2021-06-15 09:22:58 | 21.056 |
| 2021-06-15 09:23:58 | 21.032 |
| 2021-06-15 09:24:58 | 21.032 |
| 2021-06-15 09:25:58 | 21.032 |
| 2021-06-15 09:26:58 | 21.032 |
| 2021-06-15 09:27:58 | 21.008 |
| 2021-06-15 09:28:58 | 21.008 |
| 2021-06-15 09:29:58 | 21.008 |
| 2021-06-15 09:30:58 | 20.984 |
| 2021-06-15 09:31:58 | 20.984 |
| 2021-06-15 09:32:58 | 20.96 |
| 2021-06-15 09:33:58 | 20.96 |
| 2021-06-15 09:34:58 | 20.96 |
| 2021-06-15 09:35:58 | 20.96 |
| 2021-06-15 09:36:58 | 20.936 |
| 2021-06-15 09:37:58 | 20.936 |
| 2021-06-15 09:38:58 | 20.936 |
| 2021-06-15 09:39:58 | 20.913 |
| 2021-06-15 09:40:58 | 20.913 |
| 2021-06-15 09:41:58 | 20.913 |
| 2021-06-15 09:42:58 | 20.913 |
| 2021-06-15 09:43:58 | 20.889 |
| 2021-06-15 09:44:58 | 20.889 |
| 2021-06-15 09:45:58 | 20.889 |
| 2021-06-15 09:46:58 | 20.889 |
| 2021-06-15 09:47:58 | 20.889 |
| 2021-06-15 09:48:58 | 20.865 |
| 2021-06-15 09:49:58 | 20.865 |
| 2021-06-15 09:50:58 | 20.841 |
| 2021-06-15 09:51:58 | 20.841 |
| 2021-06-15 09:52:58 | 20.841 |
| 2021-06-15 09:53:58 | 20.841 |
| 2021-06-15 09:54:58 | 20.841 |
| 2021-06-15 09:55:58 | 20.841 |
| 2021-06-15 09:56:58 | 20.817 |
| 2021-06-15 09:57:58 | 20.817 |
| 2021-06-15 09:58:58 | 20.817 |
| 2021-06-15 09:59:58 | 20.817 |
| 2021-06-15 10:00:58 | 20.817 |
| 2021-06-15 10:01:58 | 20.793 |
| 2021-06-15 10:02:58 | 20.793 |
| 2021-06-15 10:03:58 | 20.793 |
| 2021-06-15 10:04:58 | 20.793 |
| 2021-06-15 10:05:58 | 20.793 |
| 2021-06-15 10:06:58 | 20.77 |
| 2021-06-15 10:07:58 | 20.77 |
| 2021-06-15 10:08:58 | 20.77 |
| 2021-06-15 10:09:58 | 20.77 |
| 2021-06-15 10:10:58 | 20.77 |
| 2021-06-15 10:11:58 | 20.746 |
| 2021-06-15 10:12:58 | 20.77 |
| 2021-06-15 10:13:58 | 20.746 |
| 2021-06-15 10:14:58 | 20.746 |
| 2021-06-15 10:15:58 | 20.746 |
| 2021-06-15 10:16:58 | 20.722 |
| 2021-06-15 10:17:58 | 20.722 |
| 2021-06-15 10:18:58 | 20.722 |
| 2021-06-15 10:19:58 | 20.722 |
| 2021-06-15 10:20:58 | 20.722 |
| 2021-06-15 10:21:58 | 20.698 |
| 2021-06-15 10:22:58 | 20.698 |
| 2021-06-15 10:23:58 | 20.698 |
| 2021-06-15 10:24:58 | 20.698 |
| 2021-06-15 10:25:58 | 20.698 |
| 2021-06-15 10:26:58 | 20.674 |
| 2021-06-15 10:27:58 | 20.674 |
| 2021-06-15 10:28:58 | 20.674 |
| 2021-06-15 10:29:58 | 20.674 |
| 2021-06-15 10:30:58 | 20.674 |
| 2021-06-15 10:31:58 | 20.674 |
| 2021-06-15 10:32:58 | 20.65 |
| 2021-06-15 10:33:58 | 20.65 |
| 2021-06-15 10:34:58 | 20.65 |
| 2021-06-15 10:35:58 | 20.65 |
| 2021-06-15 10:36:58 | 20.65 |
| 2021-06-15 10:37:58 | 20.627 |
| 2021-06-15 10:38:58 | 20.627 |
| 2021-06-15 10:39:58 | 20.627 |
| 2021-06-15 10:40:58 | 20.627 |
| 2021-06-15 10:41:58 | 20.627 |
| 2021-06-15 10:42:58 | 20.603 |
| 2021-06-15 10:43:58 | 20.603 |
| 2021-06-15 10:44:58 | 20.603 |
| 2021-06-15 10:45:58 | 20.603 |
| 2021-06-15 10:46:58 | 20.579 |
| 2021-06-15 10:47:58 | 20.579 |
| 2021-06-15 10:48:58 | 20.603 |
| 2021-06-15 10:49:58 | 20.579 |
| 2021-06-15 10:50:58 | 20.579 |
| 2021-06-15 10:51:58 | 20.579 |
| 2021-06-15 10:52:58 | 20.579 |
| 2021-06-15 10:53:58 | 20.555 |
| 2021-06-15 10:54:58 | 20.555 |
| 2021-06-15 10:55:58 | 20.555 |
| 2021-06-15 10:56:58 | 20.555 |
| 2021-06-15 10:57:58 | 20.555 |
| 2021-06-15 10:58:58 | 20.555 |
| 2021-06-15 10:59:58 | 20.531 |
| 2021-06-15 11:00:58 | 20.531 |
| 2021-06-15 11:01:58 | 20.531 |
| 2021-06-15 11:02:58 | 20.531 |
| 2021-06-15 11:03:58 | 20.531 |
| 2021-06-15 11:04:58 | 20.531 |
| 2021-06-15 11:05:58 | 20.531 |
| 2021-06-15 11:06:58 | 20.531 |
| 2021-06-15 11:07:58 | 20.531 |
| 2021-06-15 11:08:58 | 20.531 |
| 2021-06-15 11:09:58 | 20.531 |
| 2021-06-15 11:10:58 | 20.531 |
| 2021-06-15 11:11:58 | 20.507 |
| 2021-06-15 11:12:58 | 20.507 |
| 2021-06-15 11:13:58 | 20.507 |
| 2021-06-15 11:14:58 | 20.507 |
| 2021-06-15 11:15:58 | 20.507 |
| 2021-06-15 11:16:58 | 20.507 |
| 2021-06-15 11:17:58 | 20.507 |
| 2021-06-15 11:18:58 | 20.507 |
| 2021-06-15 11:19:58 | 20.507 |
| 2021-06-15 11:20:58 | 20.507 |
| 2021-06-15 11:21:58 | 20.507 |
| 2021-06-15 11:22:58 | 20.507 |
| 2021-06-15 11:23:58 | 20.507 |
| 2021-06-15 11:24:58 | 20.507 |
| 2021-06-15 11:25:58 | 20.484 |
| 2021-06-15 11:26:58 | 20.484 |
| 2021-06-15 11:27:58 | 20.484 |
| 2021-06-15 11:28:58 | 20.507 |
| 2021-06-15 11:29:58 | 20.484 |
| 2021-06-15 11:30:58 | 20.484 |
| 2021-06-15 11:31:58 | 20.484 |
| 2021-06-15 11:32:58 | 20.484 |
| 2021-06-15 11:33:58 | 20.484 |
| 2021-06-15 11:34:58 | 20.484 |
| 2021-06-15 11:35:58 | 20.484 |
| 2021-06-15 11:36:58 | 20.484 |
| 2021-06-15 11:37:58 | 20.46 |
| 2021-06-15 11:38:58 | 20.46 |
| 2021-06-15 11:39:58 | 20.46 |
| 2021-06-15 11:40:58 | 20.46 |
| 2021-06-15 11:41:58 | 20.46 |
| 2021-06-15 11:42:58 | 20.46 |
| 2021-06-15 11:43:58 | 20.46 |
| 2021-06-15 11:44:58 | 20.46 |
| 2021-06-15 11:45:58 | 20.436 |
| 2021-06-15 11:46:58 | 20.436 |
| 2021-06-15 11:47:58 | 20.436 |
| 2021-06-15 11:48:58 | 20.436 |
| 2021-06-15 11:49:58 | 20.436 |
| 2021-06-15 11:50:58 | 20.436 |
| 2021-06-15 11:51:58 | 20.436 |
| 2021-06-15 11:52:58 | 20.436 |
| 2021-06-15 11:53:58 | 20.412 |
| 2021-06-15 11:54:58 | 20.412 |
| 2021-06-15 11:55:58 | 20.412 |
| 2021-06-15 11:56:58 | 20.412 |
| 2021-06-15 11:57:58 | 20.412 |
| 2021-06-15 11:58:58 | 20.412 |
| 2021-06-15 11:59:58 | 20.388 |
| 2021-06-15 12:00:58 | 20.388 |
| 2021-06-15 12:01:58 | 20.412 |
| 2021-06-15 12:02:58 | 20.388 |
| 2021-06-15 12:03:58 | 20.388 |
| 2021-06-15 12:04:58 | 20.388 |
| 2021-06-15 12:05:58 | 20.365 |
| 2021-06-15 12:06:58 | 20.365 |
| 2021-06-15 12:07:58 | 20.365 |
| 2021-06-15 12:08:58 | 20.365 |
| 2021-06-15 12:09:58 | 20.365 |
| 2021-06-15 12:10:58 | 20.341 |
| 2021-06-15 12:11:58 | 20.341 |
| 2021-06-15 12:12:58 | 20.341 |
| 2021-06-15 12:13:58 | 20.341 |
| 2021-06-15 12:14:58 | 20.341 |
| 2021-06-15 12:15:58 | 20.341 |
| 2021-06-15 12:16:58 | 20.341 |
| 2021-06-15 12:17:58 | 20.317 |
| 2021-06-15 12:18:58 | 20.317 |
| 2021-06-15 12:19:58 | 20.317 |
| 2021-06-15 12:20:58 | 20.317 |
| 2021-06-15 12:21:58 | 20.317 |
| 2021-06-15 12:22:58 | 20.317 |
| 2021-06-15 12:23:58 | 20.317 |
| 2021-06-15 12:24:58 | 20.317 |
| 2021-06-15 12:25:58 | 20.293 |
| 2021-06-15 12:26:58 | 20.317 |
| 2021-06-15 12:27:58 | 20.293 |
| 2021-06-15 12:28:58 | 20.293 |
| 2021-06-15 12:29:58 | 20.293 |
| 2021-06-15 12:30:58 | 20.293 |
| 2021-06-15 12:31:58 | 20.293 |
| 2021-06-15 12:32:58 | 20.293 |
| 2021-06-15 12:33:58 | 20.293 |
| 2021-06-15 12:34:58 | 20.293 |
| 2021-06-15 12:35:58 | 20.293 |
| 2021-06-15 12:36:58 | 20.269 |
| 2021-06-15 12:37:58 | 20.269 |
| 2021-06-15 12:38:58 | 20.269 |
| 2021-06-15 12:39:58 | 20.269 |
| 2021-06-15 12:40:58 | 20.269 |
| 2021-06-15 12:41:58 | 20.269 |
| 2021-06-15 12:42:58 | 20.269 |
| 2021-06-15 12:43:58 | 20.269 |
| 2021-06-15 12:44:58 | 20.269 |
| 2021-06-15 12:45:58 | 20.269 |
| 2021-06-15 12:46:58 | 20.269 |
| 2021-06-15 12:47:58 | 20.269 |
| 2021-06-15 12:48:58 | 20.246 |
| 2021-06-15 12:49:58 | 20.246 |
| 2021-06-15 12:50:58 | 20.246 |
| 2021-06-15 12:51:58 | 20.246 |
| 2021-06-15 12:52:58 | 20.246 |
| 2021-06-15 12:53:58 | 20.246 |
| 2021-06-15 12:54:58 | 20.246 |
| 2021-06-15 12:55:58 | 20.246 |
| 2021-06-15 12:56:58 | 20.246 |
| 2021-06-15 12:57:58 | 20.246 |
| 2021-06-15 12:58:58 | 20.246 |
| 2021-06-15 12:59:58 | 20.246 |
| 2021-06-15 13:00:58 | 20.246 |
| 2021-06-15 13:01:58 | 20.222 |
| 2021-06-15 13:02:58 | 20.222 |
| 2021-06-15 13:03:58 | 20.222 |
| 2021-06-15 13:04:58 | 20.222 |
| 2021-06-15 13:05:58 | 20.222 |
| 2021-06-15 13:06:58 | 20.222 |
| 2021-06-15 13:07:58 | 20.222 |
| 2021-06-15 13:08:58 | 20.222 |
| 2021-06-15 13:09:58 | 20.222 |
| 2021-06-15 13:10:58 | 20.222 |
| 2021-06-15 13:11:58 | 20.222 |
| 2021-06-15 13:12:58 | 20.222 |
| 2021-06-15 13:13:58 | 20.222 |
| 2021-06-15 13:14:58 | 20.222 |
| 2021-06-15 13:15:58 | 20.222 |
| 2021-06-15 13:16:58 | 20.198 |
| 2021-06-15 13:17:58 | 20.222 |
| 2021-06-15 13:18:58 | 20.198 |
| 2021-06-15 13:19:58 | 20.198 |
| 2021-06-15 13:20:58 | 20.198 |
| 2021-06-15 13:21:58 | 20.198 |
| 2021-06-15 13:22:58 | 20.198 |
| 2021-06-15 13:23:58 | 20.198 |
| 2021-06-15 13:24:58 | 20.198 |
| 2021-06-15 13:25:58 | 20.198 |
| 2021-06-15 13:26:58 | 20.198 |
| 2021-06-15 13:27:58 | 20.198 |
| 2021-06-15 13:28:58 | 20.198 |
| 2021-06-15 13:29:58 | 20.198 |
| 2021-06-15 13:30:58 | 20.198 |
| 2021-06-15 13:31:58 | 20.198 |
| 2021-06-15 13:32:58 | 20.198 |
| 2021-06-15 13:33:58 | 20.198 |
| 2021-06-15 13:34:58 | 20.198 |
| 2021-06-15 13:35:58 | 20.198 |
| 2021-06-15 13:36:58 | 20.198 |
| 2021-06-15 13:37:58 | 20.174 |
| 2021-06-15 13:38:58 | 20.198 |
| 2021-06-15 13:39:58 | 20.198 |
| 2021-06-15 13:40:58 | 20.198 |
| 2021-06-15 13:41:58 | 20.174 |
| 2021-06-15 13:42:58 | 20.174 |
| 2021-06-15 13:43:58 | 20.174 |
| 2021-06-15 13:44:58 | 20.198 |
| 2021-06-15 13:45:58 | 20.174 |
| 2021-06-15 13:46:58 | 20.174 |
| 2021-06-15 13:47:58 | 20.174 |
| 2021-06-15 13:48:58 | 20.174 |
| 2021-06-15 13:49:58 | 20.174 |
| 2021-06-15 13:50:58 | 20.174 |
| 2021-06-15 13:51:58 | 20.174 |
| 2021-06-15 13:52:58 | 20.174 |
| 2021-06-15 13:53:58 | 20.174 |
| 2021-06-15 13:54:58 | 20.174 |
| 2021-06-15 13:55:58 | 20.174 |
| 2021-06-15 13:56:58 | 20.174 |
| 2021-06-15 13:57:58 | 20.174 |
| 2021-06-15 13:58:58 | 20.174 |
| 2021-06-15 13:59:58 | 20.174 |
| 2021-06-15 14:00:58 | 20.174 |
| 2021-06-15 14:01:58 | 20.174 |
| 2021-06-15 14:02:58 | 20.174 |
| 2021-06-15 14:03:58 | 20.174 |
| 2021-06-15 14:04:58 | 20.174 |
| 2021-06-15 14:05:58 | 20.174 |
| 2021-06-15 14:06:58 | 20.174 |
| 2021-06-15 14:07:58 | 20.174 |
| 2021-06-15 14:08:58 | 20.174 |
| 2021-06-15 14:09:58 | 20.174 |
| 2021-06-15 14:10:58 | 20.174 |
| 2021-06-15 14:11:58 | 20.174 |
| 2021-06-15 14:12:58 | 20.15 |
| 2021-06-15 14:13:58 | 20.174 |
| 2021-06-15 14:14:58 | 20.174 |
| 2021-06-15 14:15:58 | 20.174 |
| 2021-06-15 14:16:58 | 20.15 |
| 2021-06-15 14:17:58 | 20.174 |
| 2021-06-15 14:18:58 | 20.15 |
| 2021-06-15 14:19:58 | 20.15 |
| 2021-06-15 14:20:58 | 20.15 |
| 2021-06-15 14:21:58 | 20.15 |
| 2021-06-15 14:22:58 | 20.15 |
| 2021-06-15 14:23:58 | 20.15 |
| 2021-06-15 14:24:58 | 20.15 |
| 2021-06-15 14:25:58 | 20.15 |
| 2021-06-15 14:26:58 | 20.15 |
| 2021-06-15 14:27:58 | 20.15 |
| 2021-06-15 14:28:58 | 20.15 |
| 2021-06-15 14:29:58 | 20.15 |
| 2021-06-15 14:30:58 | 20.15 |
| 2021-06-15 14:31:58 | 20.15 |
| 2021-06-15 14:32:58 | 20.15 |
| 2021-06-15 14:33:58 | 20.15 |
| 2021-06-15 14:34:58 | 20.15 |
| 2021-06-15 14:35:58 | 20.15 |
| 2021-06-15 14:36:58 | 20.15 |
| 2021-06-15 14:37:58 | 20.15 |
| 2021-06-15 14:38:58 | 20.15 |
| 2021-06-15 14:39:58 | 20.15 |
| 2021-06-15 14:40:58 | 20.15 |
| 2021-06-15 14:41:58 | 20.15 |
| 2021-06-15 14:42:58 | 20.15 |
| 2021-06-15 14:43:58 | 20.15 |
| 2021-06-15 14:44:58 | 20.15 |
| 2021-06-15 14:45:58 | 20.15 |
| 2021-06-15 14:46:58 | 20.15 |
| 2021-06-15 14:47:58 | 20.15 |
| 2021-06-15 14:48:58 | 20.15 |
| 2021-06-15 14:49:58 | 20.15 |
| 2021-06-15 14:50:58 | 20.15 |
| 2021-06-15 14:51:58 | 20.15 |
| 2021-06-15 14:52:58 | 20.15 |
| 2021-06-15 14:53:58 | 20.15 |
| 2021-06-15 14:54:58 | 20.15 |
| 2021-06-15 14:55:58 | 20.126 |
| 2021-06-15 14:56:58 | 20.15 |
| 2021-06-15 14:57:58 | 20.15 |
| 2021-06-15 14:58:58 | 20.126 |
| 2021-06-15 14:59:58 | 20.15 |
| 2021-06-15 15:00:58 | 20.15 |
| 2021-06-15 15:01:58 | 20.126 |
| 2021-06-15 15:02:58 | 20.126 |
| 2021-06-15 15:03:58 | 20.126 |
| 2021-06-15 15:04:58 | 20.126 |
| 2021-06-15 15:05:58 | 20.126 |
| 2021-06-15 15:06:58 | 20.126 |
| 2021-06-15 15:07:58 | 20.126 |
| 2021-06-15 15:08:58 | 20.126 |
| 2021-06-15 15:09:58 | 20.103 |
| 2021-06-15 15:10:58 | 20.103 |
| 2021-06-15 15:11:58 | 20.103 |
| 2021-06-15 15:12:58 | 20.103 |
| 2021-06-15 15:13:58 | 20.103 |
| 2021-06-15 15:14:58 | 20.103 |
| 2021-06-15 15:15:58 | 20.103 |
| 2021-06-15 15:16:58 | 20.103 |
| 2021-06-15 15:17:58 | 20.103 |
| 2021-06-15 15:18:58 | 20.103 |
| 2021-06-15 15:19:58 | 20.103 |
| 2021-06-15 15:20:58 | 20.103 |
| 2021-06-15 15:21:58 | 20.103 |
| 2021-06-15 15:22:58 | 20.103 |
| 2021-06-15 15:23:58 | 20.103 |
| 2021-06-15 15:24:58 | 20.103 |
| 2021-06-15 15:25:58 | 20.103 |
| 2021-06-15 15:26:58 | 20.103 |
| 2021-06-15 15:27:58 | 20.103 |
| 2021-06-15 15:28:58 | 20.103 |
| 2021-06-15 15:29:58 | 20.103 |
| 2021-06-15 15:30:58 | 20.103 |
| 2021-06-15 15:31:58 | 20.103 |
| 2021-06-15 15:32:58 | 20.103 |
| 2021-06-15 15:33:58 | 20.103 |
| 2021-06-15 15:34:58 | 20.103 |
| 2021-06-15 15:35:58 | 20.103 |
| 2021-06-15 15:36:58 | 20.103 |
| 2021-06-15 15:37:58 | 20.103 |
| 2021-06-15 15:38:58 | 20.103 |
| 2021-06-15 15:39:58 | 20.103 |
| 2021-06-15 15:40:58 | 20.103 |
| 2021-06-15 15:41:58 | 20.103 |
| 2021-06-15 15:42:58 | 20.103 |
| 2021-06-15 15:43:58 | 20.103 |
| 2021-06-15 15:44:58 | 20.103 |
| 2021-06-15 15:45:58 | 20.103 |
| 2021-06-15 15:46:58 | 20.103 |
| 2021-06-15 15:47:58 | 20.103 |
| 2021-06-15 15:48:58 | 20.103 |
| 2021-06-15 15:49:58 | 20.103 |
| 2021-06-15 15:50:58 | 20.103 |
| 2021-06-15 15:51:58 | 20.103 |
| 2021-06-15 15:52:58 | 20.103 |
| 2021-06-15 15:53:58 | 20.103 |
| 2021-06-15 15:54:58 | 20.103 |
| 2021-06-15 15:55:58 | 20.103 |
| 2021-06-15 15:56:58 | 20.103 |
| 2021-06-15 15:57:58 | 20.079 |
| 2021-06-15 15:58:58 | 20.103 |
| 2021-06-15 15:59:58 | 20.079 |
| 2021-06-15 16:00:58 | 20.079 |
| 2021-06-15 16:01:58 | 20.079 |
| 2021-06-15 16:02:58 | 20.079 |
| 2021-06-15 16:03:58 | 20.079 |
| 2021-06-15 16:04:58 | 20.079 |
| 2021-06-15 16:05:58 | 20.079 |
| 2021-06-15 16:06:58 | 20.079 |
| 2021-06-15 16:07:58 | 20.079 |
| 2021-06-15 16:08:58 | 20.079 |
| 2021-06-15 16:09:58 | 20.079 |
| 2021-06-15 16:10:58 | 20.079 |
| 2021-06-15 16:11:58 | 20.079 |
| 2021-06-15 16:12:58 | 20.079 |
| 2021-06-15 16:13:58 | 20.079 |
| 2021-06-15 16:14:58 | 20.079 |
| 2021-06-15 16:15:58 | 20.055 |
| 2021-06-15 16:16:58 | 20.055 |
| 2021-06-15 16:17:58 | 20.055 |
| 2021-06-15 16:18:58 | 20.055 |
| 2021-06-15 16:19:58 | 20.055 |
| 2021-06-15 16:20:58 | 20.055 |
| 2021-06-15 16:21:58 | 20.055 |
| 2021-06-15 16:22:58 | 20.055 |
| 2021-06-15 16:23:58 | 20.055 |
| 2021-06-15 16:24:58 | 20.055 |
| 2021-06-15 16:25:58 | 20.055 |
| 2021-06-15 16:26:58 | 20.055 |
| 2021-06-15 16:27:58 | 20.055 |
| 2021-06-15 16:28:58 | 20.055 |
| 2021-06-15 16:29:58 | 20.031 |
| 2021-06-15 16:30:58 | 20.031 |
| 2021-06-15 16:31:58 | 20.031 |
| 2021-06-15 16:32:58 | 20.031 |
| 2021-06-15 16:33:58 | 20.031 |
| 2021-06-15 16:34:58 | 20.031 |
| 2021-06-15 16:35:58 | 20.031 |
| 2021-06-15 16:36:58 | 20.007 |
| 2021-06-15 16:37:58 | 20.007 |
| 2021-06-15 16:38:58 | 20.007 |
| 2021-06-15 16:39:58 | 20.007 |
| 2021-06-15 16:40:58 | 20.007 |
| 2021-06-15 16:41:58 | 20.007 |
| 2021-06-15 16:42:58 | 19.984 |
| 2021-06-15 16:43:58 | 19.984 |
| 2021-06-15 16:44:58 | 19.984 |
| 2021-06-15 16:45:58 | 19.984 |
| 2021-06-15 16:46:58 | 19.96 |
| 2021-06-15 16:47:58 | 19.96 |
| 2021-06-15 16:48:58 | 19.96 |
| 2021-06-15 16:49:58 | 19.96 |
| 2021-06-15 16:50:58 | 19.96 |
| 2021-06-15 16:51:58 | 19.96 |
| 2021-06-15 16:52:58 | 19.96 |
| 2021-06-15 16:53:58 | 19.96 |
| 2021-06-15 16:54:58 | 19.96 |
| 2021-06-15 16:55:58 | 19.96 |
| 2021-06-15 16:56:58 | 19.96 |
| 2021-06-15 16:57:58 | 19.96 |
| 2021-06-15 16:58:58 | 19.96 |
| 2021-06-15 16:59:58 | 19.96 |
| 2021-06-15 17:00:58 | 19.96 |
| 2021-06-15 17:01:58 | 19.96 |
| 2021-06-15 17:02:58 | 19.984 |
| 2021-06-15 17:03:58 | 19.984 |
| 2021-06-15 17:04:58 | 19.984 |
| 2021-06-15 17:05:58 | 19.984 |
| 2021-06-15 17:06:58 | 20.007 |
| 2021-06-15 17:07:58 | 20.007 |
| 2021-06-15 17:08:58 | 20.007 |
| 2021-06-15 17:09:58 | 20.031 |
| 2021-06-15 17:10:58 | 20.031 |
| 2021-06-15 17:11:58 | 20.031 |
| 2021-06-15 17:12:58 | 20.055 |
| 2021-06-15 17:13:58 | 20.055 |
| 2021-06-15 17:14:58 | 20.055 |
| 2021-06-15 17:15:58 | 20.079 |
| 2021-06-15 17:16:58 | 20.079 |
| 2021-06-15 17:17:58 | 20.103 |
| 2021-06-15 17:18:58 | 20.103 |
| 2021-06-15 17:19:58 | 20.126 |
| 2021-06-15 17:20:58 | 20.126 |
| 2021-06-15 17:21:58 | 20.15 |
| 2021-06-15 17:22:58 | 20.15 |
| 2021-06-15 17:23:58 | 20.174 |
| 2021-06-15 17:24:58 | 20.174 |
| 2021-06-15 17:25:58 | 20.174 |
| 2021-06-15 17:26:58 | 20.198 |
| 2021-06-15 17:27:58 | 20.222 |
| 2021-06-15 17:28:58 | 20.222 |
| 2021-06-15 17:29:58 | 20.222 |
| 2021-06-15 17:30:58 | 20.246 |
| 2021-06-15 17:31:58 | 20.269 |
| 2021-06-15 17:32:58 | 20.269 |
| 2021-06-15 17:33:58 | 20.293 |
| 2021-06-15 17:34:58 | 20.293 |
| 2021-06-15 17:35:58 | 20.317 |
| 2021-06-15 17:36:58 | 20.317 |
| 2021-06-15 17:37:58 | 20.341 |
| 2021-06-15 17:38:58 | 20.341 |
| 2021-06-15 17:39:58 | 20.365 |
| 2021-06-15 17:40:58 | 20.365 |
| 2021-06-15 17:41:58 | 20.388 |
| 2021-06-15 17:42:58 | 20.412 |
| 2021-06-15 17:43:58 | 20.412 |
| 2021-06-15 17:44:58 | 20.436 |
| 2021-06-15 17:45:58 | 20.436 |
| 2021-06-15 17:46:58 | 20.46 |
| 2021-06-15 17:47:58 | 20.46 |
| 2021-06-15 17:48:58 | 20.484 |
| 2021-06-15 17:49:58 | 20.484 |
| 2021-06-15 17:50:58 | 20.507 |
| 2021-06-15 17:51:58 | 20.507 |
| 2021-06-15 17:52:58 | 20.531 |
| 2021-06-15 17:53:58 | 20.531 |
| 2021-06-15 17:54:58 | 20.555 |
| 2021-06-15 17:55:58 | 20.579 |
| 2021-06-15 17:56:58 | 20.579 |
| 2021-06-15 17:57:58 | 20.579 |
| 2021-06-15 17:58:58 | 20.603 |
| 2021-06-15 17:59:58 | 20.627 |
| 2021-06-15 18:00:58 | 20.627 |
| 2021-06-15 18:01:58 | 20.65 |
| 2021-06-15 18:02:58 | 20.65 |
| 2021-06-15 18:03:58 | 20.674 |
| 2021-06-15 18:04:58 | 20.674 |
| 2021-06-15 18:05:58 | 20.674 |
| 2021-06-15 18:06:58 | 20.698 |
| 2021-06-15 18:07:58 | 20.722 |
| 2021-06-15 18:08:58 | 20.722 |
| 2021-06-15 18:09:58 | 20.722 |
| 2021-06-15 18:10:58 | 20.746 |
| 2021-06-15 18:11:58 | 20.746 |
| 2021-06-15 18:12:58 | 20.77 |
| 2021-06-15 18:13:58 | 20.77 |
| 2021-06-15 18:14:58 | 20.793 |
| 2021-06-15 18:15:58 | 20.793 |
| 2021-06-15 18:16:58 | 20.817 |
| 2021-06-15 18:17:58 | 20.817 |
| 2021-06-15 18:18:58 | 20.817 |
| 2021-06-15 18:19:58 | 20.841 |
| 2021-06-15 18:20:58 | 20.841 |
| 2021-06-15 18:21:58 | 20.865 |
| 2021-06-15 18:22:58 | 20.865 |
| 2021-06-15 18:23:58 | 20.889 |
| 2021-06-15 18:24:58 | 20.889 |
| 2021-06-15 18:25:58 | 20.889 |
| 2021-06-15 18:26:58 | 20.913 |
| 2021-06-15 18:27:58 | 20.913 |
| 2021-06-15 18:28:58 | 20.936 |
| 2021-06-15 18:29:58 | 20.936 |
| 2021-06-15 18:30:58 | 20.96 |
| 2021-06-15 18:31:58 | 20.96 |
| 2021-06-15 18:32:58 | 20.96 |
| 2021-06-15 18:33:58 | 20.984 |
| 2021-06-15 18:34:58 | 20.984 |
| 2021-06-15 18:35:58 | 20.984 |
| 2021-06-15 18:36:58 | 21.008 |
| 2021-06-15 18:37:58 | 21.008 |
| 2021-06-15 18:38:58 | 21.032 |
| 2021-06-15 18:39:58 | 21.032 |
| 2021-06-15 18:40:58 | 21.032 |
| 2021-06-15 18:41:58 | 21.032 |
| 2021-06-15 18:42:58 | 21.056 |
| 2021-06-15 18:43:58 | 21.056 |
| 2021-06-15 18:44:58 | 21.056 |
| 2021-06-15 18:45:58 | 21.079 |
| 2021-06-15 18:46:58 | 21.079 |
| 2021-06-15 18:47:58 | 21.103 |
| 2021-06-15 18:48:58 | 21.103 |
| 2021-06-15 18:49:58 | 21.103 |
| 2021-06-15 18:50:58 | 21.103 |
| 2021-06-15 18:51:58 | 21.127 |
| 2021-06-15 18:52:58 | 21.127 |
| 2021-06-15 18:53:58 | 21.127 |
| 2021-06-15 18:54:58 | 21.151 |
| 2021-06-15 18:55:58 | 21.151 |
| 2021-06-15 18:56:58 | 21.151 |
| 2021-06-15 18:57:58 | 21.151 |
| 2021-06-15 18:58:58 | 21.175 |
| 2021-06-15 18:59:58 | 21.175 |
| 2021-06-15 19:00:58 | 21.175 |
| 2021-06-15 19:01:58 | 21.199 |
| 2021-06-15 19:02:58 | 21.175 |
| 2021-06-15 19:03:58 | 21.199 |
| 2021-06-15 19:04:58 | 21.199 |
| 2021-06-15 19:05:58 | 21.223 |
| 2021-06-15 19:06:58 | 21.223 |
| 2021-06-15 19:07:58 | 21.223 |
| 2021-06-15 19:08:58 | 21.223 |
| 2021-06-15 19:09:58 | 21.246 |
| 2021-06-15 19:10:58 | 21.246 |
| 2021-06-15 19:11:58 | 21.246 |
| 2021-06-15 19:12:58 | 21.246 |
| 2021-06-15 19:13:58 | 21.27 |
| 2021-06-15 19:14:58 | 21.27 |
| 2021-06-15 19:15:58 | 21.27 |
| 2021-06-15 19:16:58 | 21.294 |
| 2021-06-15 19:17:58 | 21.294 |
| 2021-06-15 19:18:58 | 21.294 |
| 2021-06-15 19:19:58 | 21.294 |
| 2021-06-15 19:20:58 | 21.294 |
| 2021-06-15 19:21:58 | 21.318 |
| 2021-06-15 19:22:58 | 21.318 |
| 2021-06-15 19:23:58 | 21.318 |
| 2021-06-15 19:24:58 | 21.318 |
| 2021-06-15 19:25:58 | 21.342 |
| 2021-06-15 19:26:58 | 21.342 |
| 2021-06-15 19:27:58 | 21.342 |
| 2021-06-15 19:28:58 | 21.366 |
| 2021-06-15 19:29:58 | 21.366 |
| 2021-06-15 19:30:58 | 21.366 |
| 2021-06-15 19:31:58 | 21.366 |
| 2021-06-15 19:32:58 | 21.366 |
| 2021-06-15 19:33:58 | 21.366 |
| 2021-06-15 19:34:58 | 21.39 |
| 2021-06-15 19:35:58 | 21.39 |
| 2021-06-15 19:36:58 | 21.39 |
| 2021-06-15 19:37:58 | 21.39 |
| 2021-06-15 19:38:58 | 21.39 |
| 2021-06-15 19:39:58 | 21.413 |
| 2021-06-15 19:40:58 | 21.413 |
| 2021-06-15 19:41:58 | 21.413 |
| 2021-06-15 19:42:58 | 21.413 |
| 2021-06-15 19:43:58 | 21.437 |
| 2021-06-15 19:44:58 | 21.413 |
| 2021-06-15 19:45:58 | 21.437 |
| 2021-06-15 19:46:58 | 21.437 |
| 2021-06-15 19:47:58 | 21.437 |
| 2021-06-15 19:48:58 | 21.437 |
| 2021-06-15 19:49:58 | 21.437 |
| 2021-06-15 19:50:58 | 21.461 |
| 2021-06-15 19:51:58 | 21.461 |
| 2021-06-15 19:52:58 | 21.461 |
| 2021-06-15 19:53:58 | 21.461 |
| 2021-06-15 19:54:58 | 21.461 |
| 2021-06-15 19:55:58 | 21.485 |
| 2021-06-15 19:56:58 | 21.485 |
| 2021-06-15 19:57:58 | 21.485 |
| 2021-06-15 19:58:58 | 21.485 |
| 2021-06-15 19:59:58 | 21.485 |
| 2021-06-15 20:00:58 | 21.485 |
| 2021-06-15 20:01:58 | 21.485 |
| 2021-06-15 20:02:58 | 21.509 |
| 2021-06-15 20:03:58 | 21.509 |
| 2021-06-15 20:04:58 | 21.509 |
| 2021-06-15 20:05:58 | 21.509 |
| 2021-06-15 20:06:58 | 21.509 |
| 2021-06-15 20:07:58 | 21.509 |
| 2021-06-15 20:08:58 | 21.533 |
| 2021-06-15 20:09:58 | 21.533 |
| 2021-06-15 20:10:58 | 21.533 |
| 2021-06-15 20:11:58 | 21.533 |
| 2021-06-15 20:12:58 | 21.533 |
| 2021-06-15 20:13:58 | 21.533 |
| 2021-06-15 20:14:58 | 21.533 |
| 2021-06-15 20:15:58 | 21.533 |
| 2021-06-15 20:16:58 | 21.533 |
| 2021-06-15 20:17:58 | 21.533 |
| 2021-06-15 20:18:58 | 21.557 |
| 2021-06-15 20:19:58 | 21.533 |
| 2021-06-15 20:20:58 | 21.557 |
| 2021-06-15 20:21:58 | 21.533 |
| 2021-06-15 20:22:58 | 21.557 |
| 2021-06-15 20:23:58 | 21.557 |
| 2021-06-15 20:24:58 | 21.533 |
| 2021-06-15 20:25:58 | 21.557 |
| 2021-06-15 20:26:58 | 21.557 |
| 2021-06-15 20:27:58 | 21.557 |
| 2021-06-15 20:28:58 | 21.533 |
| 2021-06-15 20:29:58 | 21.557 |
| 2021-06-15 20:30:58 | 21.557 |
| 2021-06-15 20:31:58 | 21.533 |
| 2021-06-15 20:32:58 | 21.557 |
| 2021-06-15 20:33:58 | 21.533 |
| 2021-06-15 20:34:58 | 21.533 |
| 2021-06-15 20:35:58 | 21.533 |
| 2021-06-15 20:36:58 | 21.533 |
| 2021-06-15 20:37:58 | 21.533 |
| 2021-06-15 20:38:58 | 21.533 |
| 2021-06-15 20:39:58 | 21.533 |
| 2021-06-15 20:40:58 | 21.533 |
| 2021-06-15 20:41:58 | 21.533 |
| 2021-06-15 20:42:58 | 21.533 |
| 2021-06-15 20:43:58 | 21.533 |
| 2021-06-15 20:44:58 | 21.533 |
| 2021-06-15 20:45:58 | 21.509 |
| 2021-06-15 20:46:58 | 21.533 |
| 2021-06-15 20:47:58 | 21.509 |
| 2021-06-15 20:48:58 | 21.533 |
| 2021-06-15 20:49:58 | 21.509 |
| 2021-06-15 20:50:58 | 21.509 |
| 2021-06-15 20:51:58 | 21.509 |
| 2021-06-15 20:52:58 | 21.509 |
| 2021-06-15 20:53:58 | 21.509 |
| 2021-06-15 20:54:58 | 21.509 |
| 2021-06-15 20:55:58 | 21.509 |
| 2021-06-15 20:56:58 | 21.485 |
| 2021-06-15 20:57:58 | 21.509 |
| 2021-06-15 20:58:58 | 21.485 |
| 2021-06-15 20:59:58 | 21.485 |
| 2021-06-15 21:00:58 | 21.485 |
| 2021-06-15 21:01:58 | 21.485 |
| 2021-06-15 21:02:58 | 21.485 |
| 2021-06-15 21:03:58 | 21.485 |
| 2021-06-15 21:04:58 | 21.485 |
| 2021-06-15 21:05:58 | 21.461 |
| 2021-06-15 21:06:58 | 21.461 |
| 2021-06-15 21:07:58 | 21.461 |
| 2021-06-15 21:08:58 | 21.461 |
| 2021-06-15 21:09:58 | 21.461 |
| 2021-06-15 21:10:58 | 21.461 |
| 2021-06-15 21:11:58 | 21.461 |
| 2021-06-15 21:12:58 | 21.437 |
| 2021-06-15 21:13:58 | 21.437 |
| 2021-06-15 21:14:58 | 21.437 |
| 2021-06-15 21:15:58 | 21.437 |
| 2021-06-15 21:16:58 | 21.437 |
| 2021-06-15 21:17:58 | 21.437 |
| 2021-06-15 21:18:58 | 21.437 |
| 2021-06-15 21:19:58 | 21.437 |
| 2021-06-15 21:20:58 | 21.437 |
| 2021-06-15 21:21:58 | 21.413 |
| 2021-06-15 21:22:58 | 21.437 |
| 2021-06-15 21:23:58 | 21.437 |
| 2021-06-15 21:24:58 | 21.413 |
| 2021-06-15 21:25:58 | 21.413 |
| 2021-06-15 21:26:58 | 21.413 |
| 2021-06-15 21:27:58 | 21.413 |
| 2021-06-15 21:28:58 | 21.413 |
| 2021-06-15 21:29:58 | 21.413 |
| 2021-06-15 21:30:58 | 21.413 |
| 2021-06-15 21:31:58 | 21.413 |
| 2021-06-15 21:32:58 | 21.413 |
| 2021-06-15 21:33:58 | 21.413 |
| 2021-06-15 21:34:58 | 21.39 |
| 2021-06-15 21:35:58 | 21.39 |
| 2021-06-15 21:36:58 | 21.39 |
| 2021-06-15 21:37:58 | 21.39 |
| 2021-06-15 21:38:58 | 21.39 |
| 2021-06-15 21:39:58 | 21.39 |
| 2021-06-15 21:40:58 | 21.39 |
| 2021-06-15 21:41:58 | 21.39 |
| 2021-06-15 21:42:58 | 21.39 |
| 2021-06-15 21:43:58 | 21.39 |
| 2021-06-15 21:44:58 | 21.366 |
| 2021-06-15 21:45:58 | 21.366 |
| 2021-06-15 21:46:58 | 21.366 |
| 2021-06-15 21:47:58 | 21.39 |
| 2021-06-15 21:48:58 | 21.366 |
| 2021-06-15 21:49:58 | 21.366 |
| 2021-06-15 21:50:58 | 21.366 |
| 2021-06-15 21:51:58 | 21.366 |
| 2021-06-15 21:52:58 | 21.366 |
| 2021-06-15 21:53:58 | 21.366 |
| 2021-06-15 21:54:58 | 21.342 |
| 2021-06-15 21:55:58 | 21.342 |
| 2021-06-15 21:56:58 | 21.342 |
| 2021-06-15 21:57:58 | 21.366 |
| 2021-06-15 21:58:58 | 21.342 |
| 2021-06-15 21:59:58 | 21.342 |
| 2021-06-15 22:00:58 | 21.342 |
| 2021-06-15 22:01:58 | 21.342 |
| 2021-06-15 22:02:58 | 21.342 |
| 2021-06-15 22:03:58 | 21.342 |
| 2021-06-15 22:04:58 | 21.342 |
| 2021-06-15 22:05:58 | 21.342 |
| 2021-06-15 22:06:58 | 21.342 |
| 2021-06-15 22:07:58 | 21.342 |
| 2021-06-15 22:08:58 | 21.342 |
| 2021-06-15 22:09:58 | 21.342 |
| 2021-06-15 22:10:58 | 21.342 |
| 2021-06-15 22:11:58 | 21.342 |
| 2021-06-15 22:12:58 | 21.342 |
| 2021-06-15 22:13:58 | 21.342 |
| 2021-06-15 22:14:58 | 21.342 |
| 2021-06-15 22:15:58 | 21.318 |
| 2021-06-15 22:16:58 | 21.318 |
| 2021-06-15 22:17:58 | 21.342 |
| 2021-06-15 22:18:58 | 21.342 |
| 2021-06-15 22:19:58 | 21.318 |
| 2021-06-15 22:20:58 | 21.318 |
| 2021-06-15 22:21:58 | 21.318 |
| 2021-06-15 22:22:58 | 21.342 |
| 2021-06-15 22:23:58 | 21.318 |
| 2021-06-15 22:24:58 | 21.318 |
| 2021-06-15 22:25:58 | 21.318 |
| 2021-06-15 22:26:58 | 21.318 |
| 2021-06-15 22:27:58 | 21.318 |
| 2021-06-15 22:28:58 | 21.318 |
| 2021-06-15 22:29:58 | 21.318 |
| 2021-06-15 22:30:58 | 21.318 |
| 2021-06-15 22:31:58 | 21.318 |
| 2021-06-15 22:32:58 | 21.318 |
| 2021-06-15 22:33:58 | 21.318 |
| 2021-06-15 22:34:58 | 21.318 |
| 2021-06-15 22:35:58 | 21.318 |
| 2021-06-15 22:36:58 | 21.318 |
| 2021-06-15 22:37:58 | 21.318 |
| 2021-06-15 22:38:58 | 21.318 |
| 2021-06-15 22:39:58 | 21.318 |
| 2021-06-15 22:40:58 | 21.318 |
| 2021-06-15 22:41:58 | 21.318 |
| 2021-06-15 22:42:58 | 21.318 |
| 2021-06-15 22:43:58 | 21.294 |
| 2021-06-15 22:44:58 | 21.294 |
| 2021-06-15 22:45:58 | 21.294 |
| 2021-06-15 22:46:58 | 21.318 |
| 2021-06-15 22:47:58 | 21.318 |
| 2021-06-15 22:48:58 | 21.318 |
| 2021-06-15 22:49:58 | 21.294 |
| 2021-06-15 22:50:58 | 21.318 |
| 2021-06-15 22:51:58 | 21.294 |
| 2021-06-15 22:52:58 | 21.318 |
| 2021-06-15 22:53:58 | 21.294 |
| 2021-06-15 22:54:58 | 21.294 |
| 2021-06-15 22:55:58 | 21.318 |
| 2021-06-15 22:56:58 | 21.294 |
| 2021-06-15 22:57:58 | 21.294 |
| 2021-06-15 22:58:58 | 21.294 |
| 2021-06-15 22:59:58 | 21.294 |
| 2021-06-15 23:00:58 | 21.294 |
| 2021-06-15 23:01:58 | 21.318 |
| 2021-06-15 23:02:58 | 21.294 |
| 2021-06-15 23:03:58 | 21.294 |
| 2021-06-15 23:04:58 | 21.294 |
| 2021-06-15 23:05:58 | 21.294 |
| 2021-06-15 23:06:58 | 21.294 |
| 2021-06-15 23:07:58 | 21.294 |
| 2021-06-15 23:08:58 | 21.294 |
| 2021-06-15 23:09:58 | 21.294 |
| 2021-06-15 23:10:58 | 21.294 |
| 2021-06-15 23:11:58 | 21.294 |
| 2021-06-15 23:12:58 | 21.294 |
| 2021-06-15 23:13:58 | 21.294 |
| 2021-06-15 23:14:58 | 21.294 |
| 2021-06-15 23:15:58 | 21.294 |
| 2021-06-15 23:16:58 | 21.294 |
| 2021-06-15 23:17:58 | 21.294 |
| 2021-06-15 23:18:58 | 21.294 |
| 2021-06-15 23:19:58 | 21.294 |
| 2021-06-15 23:20:58 | 21.294 |
| 2021-06-15 23:21:58 | 21.294 |
| 2021-06-15 23:22:58 | 21.294 |
| 2021-06-15 23:23:58 | 21.294 |
| 2021-06-15 23:24:58 | 21.294 |
| 2021-06-15 23:25:58 | 21.294 |
| 2021-06-15 23:26:58 | 21.294 |
| 2021-06-15 23:27:58 | 21.294 |
| 2021-06-15 23:28:58 | 21.294 |
| 2021-06-15 23:29:58 | 21.294 |
| 2021-06-15 23:30:58 | 21.294 |
| 2021-06-15 23:31:58 | 21.294 |
| 2021-06-15 23:32:58 | 21.294 |
| 2021-06-15 23:33:58 | 21.294 |
| 2021-06-15 23:34:58 | 21.294 |
| 2021-06-15 23:35:58 | 21.294 |
| 2021-06-15 23:36:58 | 21.294 |
| 2021-06-15 23:37:58 | 21.294 |
| 2021-06-15 23:38:58 | 21.294 |
| 2021-06-15 23:39:58 | 21.294 |
| 2021-06-15 23:40:58 | 21.294 |
| 2021-06-15 23:41:58 | 21.294 |
| 2021-06-15 23:42:58 | 21.294 |
| 2021-06-15 23:43:58 | 21.294 |
| 2021-06-15 23:44:58 | 21.294 |
| 2021-06-15 23:45:58 | 21.294 |
| 2021-06-15 23:46:58 | 21.294 |
| 2021-06-15 23:47:58 | 21.294 |
| 2021-06-15 23:48:58 | 21.294 |
| 2021-06-15 23:49:58 | 21.294 |
| 2021-06-15 23:50:58 | 21.294 |
| 2021-06-15 23:51:58 | 21.294 |
| 2021-06-15 23:52:58 | 21.294 |
| 2021-06-15 23:53:58 | 21.294 |
| 2021-06-15 23:54:58 | 21.294 |
| 2021-06-15 23:55:58 | 21.294 |
| 2021-06-15 23:56:58 | 21.294 |
| 2021-06-15 23:57:58 | 21.294 |
| 2021-06-15 23:58:58 | 21.294 |
| 2021-06-15 23:59:58 | 21.294 |
| 2021-06-16 00:00:58 | 21.294 |
| 2021-06-16 00:01:58 | 21.294 |
| 2021-06-16 00:02:58 | 21.294 |
| 2021-06-16 00:03:58 | 21.294 |
| 2021-06-16 00:04:58 | 21.294 |
| 2021-06-16 00:05:58 | 21.318 |
| 2021-06-16 00:06:58 | 21.294 |
| 2021-06-16 00:07:58 | 21.318 |
| 2021-06-16 00:08:58 | 21.294 |
| 2021-06-16 00:09:58 | 21.318 |
| 2021-06-16 00:10:58 | 21.318 |
| 2021-06-16 00:11:58 | 21.294 |
| 2021-06-16 00:12:58 | 21.318 |
| 2021-06-16 00:13:58 | 21.318 |
| 2021-06-16 00:14:58 | 21.318 |
| 2021-06-16 00:15:58 | 21.318 |
| 2021-06-16 00:16:58 | 21.318 |
| 2021-06-16 00:17:58 | 21.318 |
| 2021-06-16 00:18:58 | 21.318 |
| 2021-06-16 00:19:58 | 21.318 |
| 2021-06-16 00:20:58 | 21.318 |
| 2021-06-16 00:21:58 | 21.342 |
| 2021-06-16 00:22:58 | 21.318 |
| 2021-06-16 00:23:58 | 21.342 |
| 2021-06-16 00:24:58 | 21.318 |
| 2021-06-16 00:25:58 | 21.342 |
| 2021-06-16 00:26:58 | 21.342 |
| 2021-06-16 00:27:58 | 21.342 |
| 2021-06-16 00:28:58 | 21.342 |
| 2021-06-16 00:29:58 | 21.342 |
| 2021-06-16 00:30:58 | 21.342 |
| 2021-06-16 00:31:58 | 21.342 |
| 2021-06-16 00:32:58 | 21.342 |
| 2021-06-16 00:33:58 | 21.342 |
| 2021-06-16 00:34:58 | 21.342 |
| 2021-06-16 00:35:58 | 21.342 |
| 2021-06-16 00:36:58 | 21.342 |
| 2021-06-16 00:37:58 | 21.342 |
| 2021-06-16 00:38:58 | 21.342 |
| 2021-06-16 00:39:58 | 21.342 |
| 2021-06-16 00:40:58 | 21.342 |
| 2021-06-16 00:41:58 | 21.342 |
| 2021-06-16 00:42:58 | 21.366 |
| 2021-06-16 00:43:58 | 21.342 |
| 2021-06-16 00:44:58 | 21.366 |
| 2021-06-16 00:45:58 | 21.366 |
| 2021-06-16 00:46:58 | 21.366 |
| 2021-06-16 00:47:58 | 21.366 |
| 2021-06-16 00:48:58 | 21.366 |
| 2021-06-16 00:49:58 | 21.366 |
| 2021-06-16 00:50:58 | 21.366 |
| 2021-06-16 00:51:58 | 21.366 |
| 2021-06-16 00:52:58 | 21.366 |
| 2021-06-16 00:53:58 | 21.366 |
| 2021-06-16 00:54:58 | 21.366 |
| 2021-06-16 00:55:58 | 21.39 |
| 2021-06-16 00:56:58 | 21.39 |
| 2021-06-16 00:57:58 | 21.39 |
| 2021-06-16 00:58:58 | 21.39 |
| 2021-06-16 00:59:58 | 21.39 |
| 2021-06-16 01:00:58 | 21.39 |
| 2021-06-16 01:01:58 | 21.39 |
| 2021-06-16 01:02:58 | 21.39 |
| 2021-06-16 01:03:58 | 21.39 |
| 2021-06-16 01:04:58 | 21.39 |
| 2021-06-16 01:05:58 | 21.39 |
| 2021-06-16 01:06:58 | 21.39 |
| 2021-06-16 01:07:58 | 21.39 |
| 2021-06-16 01:08:58 | 21.39 |
| 2021-06-16 01:09:58 | 21.413 |
| 2021-06-16 01:10:58 | 21.413 |
| 2021-06-16 01:11:58 | 21.413 |
| 2021-06-16 01:12:58 | 21.39 |
| 2021-06-16 01:13:58 | 21.413 |
| 2021-06-16 01:14:58 | 21.413 |
| 2021-06-16 01:15:58 | 21.413 |
| 2021-06-16 01:16:58 | 21.413 |
| 2021-06-16 01:17:58 | 21.413 |
| 2021-06-16 01:18:58 | 21.413 |
| 2021-06-16 01:19:58 | 21.413 |
| 2021-06-16 01:20:58 | 21.413 |
| 2021-06-16 01:21:58 | 21.413 |
| 2021-06-16 01:22:58 | 21.413 |
| 2021-06-16 01:23:58 | 21.413 |
| 2021-06-16 01:24:58 | 21.413 |
| 2021-06-16 01:25:58 | 21.437 |
| 2021-06-16 01:26:58 | 21.437 |
| 2021-06-16 01:27:58 | 21.437 |
| 2021-06-16 01:28:58 | 21.437 |
| 2021-06-16 01:29:58 | 21.437 |
| 2021-06-16 01:30:58 | 21.437 |
| 2021-06-16 01:31:58 | 21.437 |
| 2021-06-16 01:32:58 | 21.437 |
| 2021-06-16 01:33:58 | 21.437 |
| 2021-06-16 01:34:58 | 21.437 |
| 2021-06-16 01:35:58 | 21.437 |
| 2021-06-16 01:36:58 | 21.437 |
| 2021-06-16 01:37:58 | 21.437 |
| 2021-06-16 01:38:58 | 21.437 |
| 2021-06-16 01:39:58 | 21.437 |
| 2021-06-16 01:40:58 | 21.437 |
| 2021-06-16 01:41:58 | 21.437 |
| 2021-06-16 01:42:58 | 21.461 |
| 2021-06-16 01:43:58 | 21.437 |
| 2021-06-16 01:44:58 | 21.437 |
| 2021-06-16 01:45:58 | 21.461 |
| 2021-06-16 01:46:58 | 21.437 |
| 2021-06-16 01:47:58 | 21.437 |
| 2021-06-16 01:48:58 | 21.461 |
| 2021-06-16 01:49:58 | 21.461 |
| 2021-06-16 01:50:58 | 21.461 |
| 2021-06-16 01:51:58 | 21.461 |
| 2021-06-16 01:52:58 | 21.461 |
| 2021-06-16 01:53:58 | 21.461 |
| 2021-06-16 01:54:58 | 21.461 |
| 2021-06-16 01:55:58 | 21.461 |
| 2021-06-16 01:56:58 | 21.461 |
| 2021-06-16 01:57:58 | 21.461 |
| 2021-06-16 01:58:58 | 21.461 |
| 2021-06-16 01:59:58 | 21.461 |
| 2021-06-16 02:00:58 | 21.461 |
| 2021-06-16 02:01:58 | 21.461 |
| 2021-06-16 02:02:58 | 21.461 |
| 2021-06-16 02:03:58 | 21.461 |
| 2021-06-16 02:04:58 | 21.461 |
| 2021-06-16 02:05:58 | 21.485 |
| 2021-06-16 02:06:58 | 21.461 |
| 2021-06-16 02:07:58 | 21.461 |
| 2021-06-16 02:08:58 | 21.461 |
| 2021-06-16 02:09:58 | 21.485 |
| 2021-06-16 02:10:58 | 21.461 |
| 2021-06-16 02:11:58 | 21.461 |
| 2021-06-16 02:12:58 | 21.485 |
| 2021-06-16 02:13:58 | 21.485 |
| 2021-06-16 02:14:58 | 21.485 |
| 2021-06-16 02:15:58 | 21.461 |
| 2021-06-16 02:16:58 | 21.485 |
| 2021-06-16 02:17:58 | 21.485 |
| 2021-06-16 02:18:58 | 21.485 |
| 2021-06-16 02:19:58 | 21.485 |
| 2021-06-16 02:20:58 | 21.485 |
| 2021-06-16 02:21:58 | 21.485 |
| 2021-06-16 02:22:58 | 21.485 |
| 2021-06-16 02:23:58 | 21.485 |
| 2021-06-16 02:24:58 | 21.485 |
| 2021-06-16 02:25:58 | 21.485 |
| 2021-06-16 02:26:58 | 21.485 |
| 2021-06-16 02:27:58 | 21.485 |
| 2021-06-16 02:28:58 | 21.485 |
| 2021-06-16 02:29:58 | 21.485 |
| 2021-06-16 02:30:58 | 21.485 |
| 2021-06-16 02:31:58 | 21.485 |
| 2021-06-16 02:32:58 | 21.485 |
| 2021-06-16 02:33:58 | 21.485 |
| 2021-06-16 02:34:58 | 21.485 |
| 2021-06-16 02:35:58 | 21.485 |
| 2021-06-16 02:36:58 | 21.485 |
| 2021-06-16 02:37:58 | 21.485 |
| 2021-06-16 02:38:58 | 21.509 |
| 2021-06-16 02:39:58 | 21.509 |
| 2021-06-16 02:40:58 | 21.509 |
| 2021-06-16 02:41:58 | 21.485 |
| 2021-06-16 02:42:58 | 21.485 |
| 2021-06-16 02:43:58 | 21.509 |
| 2021-06-16 02:44:58 | 21.509 |
| 2021-06-16 02:45:58 | 21.509 |
| 2021-06-16 02:46:58 | 21.509 |
| 2021-06-16 02:47:58 | 21.509 |
| 2021-06-16 02:48:58 | 21.509 |
| 2021-06-16 02:49:58 | 21.509 |
| 2021-06-16 02:50:58 | 21.509 |
| 2021-06-16 02:51:58 | 21.509 |
| 2021-06-16 02:52:58 | 21.509 |
| 2021-06-16 02:53:58 | 21.509 |
| 2021-06-16 02:54:58 | 21.509 |
| 2021-06-16 02:55:58 | 21.509 |
| 2021-06-16 02:56:58 | 21.509 |
| 2021-06-16 02:57:58 | 21.509 |
| 2021-06-16 02:58:58 | 21.509 |
| 2021-06-16 02:59:58 | 21.509 |
| 2021-06-16 03:00:58 | 21.485 |
| 2021-06-16 03:01:58 | 21.509 |
| 2021-06-16 03:02:58 | 21.509 |
| 2021-06-16 03:03:58 | 21.509 |
| 2021-06-16 03:04:58 | 21.485 |
| 2021-06-16 03:05:58 | 21.509 |
| 2021-06-16 03:06:58 | 21.485 |
| 2021-06-16 03:07:58 | 21.485 |
| 2021-06-16 03:08:58 | 21.485 |
| 2021-06-16 03:09:58 | 21.509 |
| 2021-06-16 03:10:58 | 21.509 |
| 2021-06-16 03:11:58 | 21.485 |
| 2021-06-16 03:12:58 | 21.485 |
| 2021-06-16 03:13:58 | 21.485 |
| 2021-06-16 03:14:58 | 21.485 |
| 2021-06-16 03:15:58 | 21.485 |
| 2021-06-16 03:16:58 | 21.509 |
| 2021-06-16 03:17:58 | 21.485 |
| 2021-06-16 03:18:58 | 21.485 |
| 2021-06-16 03:19:58 | 21.485 |
| 2021-06-16 03:20:58 | 21.485 |
| 2021-06-16 03:21:58 | 21.485 |
| 2021-06-16 03:22:58 | 21.485 |
| 2021-06-16 03:23:58 | 21.485 |
| 2021-06-16 03:24:58 | 21.485 |
| 2021-06-16 03:25:58 | 21.485 |
| 2021-06-16 03:26:58 | 21.485 |
| 2021-06-16 03:27:58 | 21.485 |
| 2021-06-16 03:28:58 | 21.485 |
| 2021-06-16 03:29:58 | 21.485 |
| 2021-06-16 03:30:58 | 21.485 |
| 2021-06-16 03:31:58 | 21.485 |
| 2021-06-16 03:32:58 | 21.485 |
| 2021-06-16 03:33:58 | 21.485 |
| 2021-06-16 03:34:58 | 21.485 |
| 2021-06-16 03:35:58 | 21.485 |
| 2021-06-16 03:36:58 | 21.485 |
| 2021-06-16 03:37:58 | 21.485 |
| 2021-06-16 03:38:58 | 21.485 |
| 2021-06-16 03:39:58 | 21.485 |
| 2021-06-16 03:40:58 | 21.485 |
| 2021-06-16 03:41:58 | 21.485 |
| 2021-06-16 03:42:58 | 21.485 |
| 2021-06-16 03:43:58 | 21.461 |
| 2021-06-16 03:44:58 | 21.485 |
| 2021-06-16 03:45:58 | 21.461 |
| 2021-06-16 03:46:58 | 21.461 |
| 2021-06-16 03:47:58 | 21.485 |
| 2021-06-16 03:48:58 | 21.461 |
| 2021-06-16 03:49:58 | 21.461 |
| 2021-06-16 03:50:58 | 21.461 |
| 2021-06-16 03:51:58 | 21.461 |
| 2021-06-16 03:52:58 | 21.461 |
| 2021-06-16 03:53:58 | 21.461 |
| 2021-06-16 03:54:58 | 21.461 |
| 2021-06-16 03:55:58 | 21.461 |
| 2021-06-16 03:56:58 | 21.461 |
| 2021-06-16 03:57:58 | 21.461 |
| 2021-06-16 03:58:58 | 21.461 |
| 2021-06-16 03:59:58 | 21.461 |
| 2021-06-16 04:00:58 | 21.461 |
| 2021-06-16 04:01:58 | 21.461 |
| 2021-06-16 04:02:58 | 21.461 |
| 2021-06-16 04:03:58 | 21.485 |
| 2021-06-16 04:04:58 | 21.461 |
| 2021-06-16 04:05:58 | 21.461 |
| 2021-06-16 04:06:58 | 21.461 |
| 2021-06-16 04:07:58 | 21.461 |
| 2021-06-16 04:08:58 | 21.461 |
| 2021-06-16 04:09:58 | 21.461 |
| 2021-06-16 04:10:58 | 21.461 |
| 2021-06-16 04:11:58 | 21.461 |
| 2021-06-16 04:12:58 | 21.461 |
| 2021-06-16 04:13:58 | 21.461 |
| 2021-06-16 04:14:58 | 21.461 |
| 2021-06-16 04:15:58 | 21.461 |
| 2021-06-16 04:16:58 | 21.461 |
| 2021-06-16 04:17:58 | 21.461 |
| 2021-06-16 04:18:58 | 21.461 |
| 2021-06-16 04:19:58 | 21.461 |
| 2021-06-16 04:20:58 | 21.461 |
| 2021-06-16 04:21:58 | 21.461 |
| 2021-06-16 04:22:58 | 21.461 |
| 2021-06-16 04:23:58 | 21.461 |
| 2021-06-16 04:24:58 | 21.461 |
| 2021-06-16 04:25:58 | 21.461 |
| 2021-06-16 04:26:58 | 21.485 |
| 2021-06-16 04:27:58 | 21.461 |
| 2021-06-16 04:28:58 | 21.461 |
| 2021-06-16 04:29:58 | 21.485 |
| 2021-06-16 04:30:58 | 21.461 |
| 2021-06-16 04:31:58 | 21.485 |
| 2021-06-16 04:32:58 | 21.461 |
| 2021-06-16 04:33:58 | 21.461 |
| 2021-06-16 04:34:58 | 21.461 |
| 2021-06-16 04:35:58 | 21.461 |
| 2021-06-16 04:36:58 | 21.461 |
| 2021-06-16 04:37:58 | 21.485 |
| 2021-06-16 04:38:58 | 21.461 |
| 2021-06-16 04:39:58 | 21.461 |
| 2021-06-16 04:40:58 | 21.461 |
| 2021-06-16 04:41:58 | 21.461 |
| 2021-06-16 04:42:58 | 21.461 |
| 2021-06-16 04:43:58 | 21.461 |
| 2021-06-16 04:44:58 | 21.461 |
| 2021-06-16 04:45:58 | 21.461 |
| 2021-06-16 04:46:58 | 21.461 |
| 2021-06-16 04:47:58 | 21.461 |
| 2021-06-16 04:48:58 | 21.461 |
| 2021-06-16 04:49:58 | 21.461 |
| 2021-06-16 04:50:58 | 21.461 |
| 2021-06-16 04:51:58 | 21.461 |
| 2021-06-16 04:52:58 | 21.461 |
| 2021-06-16 04:53:58 | 21.461 |
| 2021-06-16 04:54:58 | 21.485 |
| 2021-06-16 04:55:58 | 21.485 |
| 2021-06-16 04:56:58 | 21.485 |
| 2021-06-16 04:57:58 | 21.485 |
| 2021-06-16 04:58:58 | 21.461 |
| 2021-06-16 04:59:58 | 21.485 |
| 2021-06-16 05:00:58 | 21.485 |
| 2021-06-16 05:01:58 | 21.485 |
| 2021-06-16 05:02:58 | 21.485 |
| 2021-06-16 05:03:58 | 21.485 |
| 2021-06-16 05:04:58 | 21.485 |
| 2021-06-16 05:05:58 | 21.485 |
| 2021-06-16 05:06:58 | 21.485 |
| 2021-06-16 05:07:58 | 21.485 |
| 2021-06-16 05:08:58 | 21.485 |
| 2021-06-16 05:09:58 | 21.485 |
| 2021-06-16 05:10:58 | 21.485 |
| 2021-06-16 05:11:58 | 21.485 |
| 2021-06-16 05:12:58 | 21.485 |
| 2021-06-16 05:13:58 | 21.485 |
| 2021-06-16 05:14:58 | 21.485 |
| 2021-06-16 05:15:58 | 21.485 |
| 2021-06-16 05:16:58 | 21.485 |
| 2021-06-16 05:17:58 | 21.485 |
| 2021-06-16 05:18:58 | 21.485 |
| 2021-06-16 05:19:58 | 21.485 |
| 2021-06-16 05:20:58 | 21.485 |
| 2021-06-16 05:21:58 | 21.485 |
| 2021-06-16 05:22:58 | 21.485 |
| 2021-06-16 05:23:58 | 21.485 |
| 2021-06-16 05:24:58 | 21.485 |
| 2021-06-16 05:25:58 | 21.485 |
| 2021-06-16 05:26:58 | 21.485 |
| 2021-06-16 05:27:58 | 21.485 |
| 2021-06-16 05:28:58 | 21.485 |
| 2021-06-16 05:29:58 | 21.485 |
| 2021-06-16 05:30:58 | 21.485 |
| 2021-06-16 05:31:58 | 21.485 |
| 2021-06-16 05:32:58 | 21.485 |
| 2021-06-16 05:33:58 | 21.461 |
| 2021-06-16 05:34:58 | 21.485 |
| 2021-06-16 05:35:58 | 21.485 |
| 2021-06-16 05:36:58 | 21.485 |
| 2021-06-16 05:37:58 | 21.485 |
| 2021-06-16 05:38:58 | 21.485 |
| 2021-06-16 05:39:58 | 21.485 |
| 2021-06-16 05:40:58 | 21.485 |
| 2021-06-16 05:41:58 | 21.485 |
| 2021-06-16 05:42:58 | 21.485 |
| 2021-06-16 05:43:58 | 21.485 |
| 2021-06-16 05:44:58 | 21.485 |
| 2021-06-16 05:45:58 | 21.485 |
| 2021-06-16 05:46:58 | 21.485 |
| 2021-06-16 05:47:58 | 21.485 |
| 2021-06-16 05:48:58 | 21.485 |
| 2021-06-16 05:49:58 | 21.485 |
| 2021-06-16 05:50:58 | 21.485 |
| 2021-06-16 05:51:58 | 21.485 |
| 2021-06-16 05:52:58 | 21.485 |
| 2021-06-16 05:53:58 | 21.485 |
| 2021-06-16 05:54:58 | 21.485 |
| 2021-06-16 05:55:58 | 21.485 |
| 2021-06-16 05:56:58 | 21.485 |
| 2021-06-16 05:57:58 | 21.485 |
| 2021-06-16 05:58:58 | 21.485 |
| 2021-06-16 05:59:58 | 21.509 |
| 2021-06-16 06:00:58 | 21.485 |
| 2021-06-16 06:01:58 | 21.485 |
| 2021-06-16 06:02:58 | 21.509 |
| 2021-06-16 06:03:58 | 21.509 |
| 2021-06-16 06:04:58 | 21.485 |
| 2021-06-16 06:05:58 | 21.509 |
| 2021-06-16 06:06:58 | 21.509 |
| 2021-06-16 06:07:58 | 21.509 |
| 2021-06-16 06:08:58 | 21.509 |
| 2021-06-16 06:09:58 | 21.509 |
| 2021-06-16 06:10:58 | 21.509 |
| 2021-06-16 06:11:58 | 21.509 |
| 2021-06-16 06:12:58 | 21.509 |
| 2021-06-16 06:13:58 | 21.509 |
| 2021-06-16 06:14:58 | 21.509 |
| 2021-06-16 06:15:58 | 21.509 |
| 2021-06-16 06:16:58 | 21.533 |
| 2021-06-16 06:17:58 | 21.509 |
| 2021-06-16 06:18:58 | 21.509 |
| 2021-06-16 06:19:58 | 21.533 |
| 2021-06-16 06:20:58 | 21.533 |
| 2021-06-16 06:21:58 | 21.533 |
| 2021-06-16 06:22:58 | 21.533 |
| 2021-06-16 06:23:58 | 21.533 |
| 2021-06-16 06:24:58 | 21.533 |
| 2021-06-16 06:25:58 | 21.533 |
| 2021-06-16 06:26:58 | 21.533 |
| 2021-06-16 06:27:58 | 21.557 |
| 2021-06-16 06:28:58 | 21.557 |
| 2021-06-16 06:29:58 | 21.557 |
| 2021-06-16 06:30:58 | 21.557 |
| 2021-06-16 06:31:58 | 21.557 |
| 2021-06-16 06:32:58 | 21.557 |
| 2021-06-16 06:33:58 | 21.557 |
| 2021-06-16 06:34:58 | 21.557 |
| 2021-06-16 06:35:58 | 21.557 |
| 2021-06-16 06:36:58 | 21.557 |
| 2021-06-16 06:37:58 | 21.557 |
| 2021-06-16 06:38:58 | 21.557 |
| 2021-06-16 06:39:58 | 21.557 |
| 2021-06-16 06:40:58 | 21.557 |
| 2021-06-16 06:41:58 | 21.557 |
| 2021-06-16 06:42:58 | 21.581 |
| 2021-06-16 06:43:58 | 21.557 |
| 2021-06-16 06:44:58 | 21.557 |
| 2021-06-16 06:45:58 | 21.557 |
| 2021-06-16 06:46:58 | 21.557 |
| 2021-06-16 06:47:58 | 21.581 |
| 2021-06-16 06:48:58 | 21.581 |
| 2021-06-16 06:49:58 | 21.581 |
| 2021-06-16 06:50:58 | 21.581 |
| 2021-06-16 06:51:58 | 21.557 |
| 2021-06-16 06:52:58 | 21.581 |
| 2021-06-16 06:53:58 | 21.557 |
| 2021-06-16 06:54:58 | 21.581 |
| 2021-06-16 06:55:58 | 21.557 |
| 2021-06-16 06:56:58 | 21.581 |
| 2021-06-16 06:57:58 | 21.581 |
| 2021-06-16 06:58:58 | 21.581 |
| 2021-06-16 06:59:58 | 21.581 |
| 2021-06-16 07:00:58 | 21.581 |
| 2021-06-16 07:01:58 | 21.581 |
| 2021-06-16 07:02:58 | 21.581 |
| 2021-06-16 07:03:58 | 21.581 |
| 2021-06-16 07:04:58 | 21.581 |
| 2021-06-16 07:05:58 | 21.581 |
| 2021-06-16 07:06:58 | 21.581 |
| 2021-06-16 07:07:58 | 21.581 |
| 2021-06-16 07:08:58 | 21.581 |
| 2021-06-16 07:09:58 | 21.581 |
| 2021-06-16 07:10:58 | 21.581 |
| 2021-06-16 07:11:58 | 21.581 |
| 2021-06-16 07:12:58 | 21.581 |
| 2021-06-16 07:13:58 | 21.604 |
| 2021-06-16 07:14:58 | 21.604 |
| 2021-06-16 07:15:58 | 21.604 |
| 2021-06-16 07:16:58 | 21.604 |
| 2021-06-16 07:17:58 | 21.604 |
| 2021-06-16 07:18:58 | 21.604 |
| 2021-06-16 07:19:58 | 21.604 |
| 2021-06-16 07:20:58 | 21.604 |
| 2021-06-16 07:21:58 | 21.604 |
| 2021-06-16 07:22:58 | 21.604 |
| 2021-06-16 07:23:58 | 21.604 |
| 2021-06-16 07:24:58 | 21.604 |
| 2021-06-16 07:25:58 | 21.628 |
| 2021-06-16 07:26:58 | 21.604 |
| 2021-06-16 07:27:58 | 21.604 |
| 2021-06-16 07:28:58 | 21.604 |
| 2021-06-16 07:29:58 | 21.604 |
| 2021-06-16 07:30:58 | 21.604 |
| 2021-06-16 07:31:58 | 21.604 |
| 2021-06-16 07:32:58 | 21.604 |
| 2021-06-16 07:33:58 | 21.604 |
| 2021-06-16 07:34:58 | 21.604 |
| 2021-06-16 07:35:58 | 21.604 |
| 2021-06-16 07:36:58 | 21.604 |
| 2021-06-16 07:37:58 | 21.581 |
| 2021-06-16 07:38:58 | 21.581 |
| 2021-06-16 07:39:58 | 21.581 |
| 2021-06-16 07:40:58 | 21.581 |
| 2021-06-16 07:41:58 | 21.581 |
| 2021-06-16 07:42:58 | 21.557 |
| 2021-06-16 07:43:58 | 21.557 |
| 2021-06-16 07:44:58 | 21.557 |
| 2021-06-16 07:45:58 | 21.533 |
| 2021-06-16 07:46:58 | 21.533 |
| 2021-06-16 07:47:58 | 21.533 |
| 2021-06-16 07:48:58 | 21.509 |
| 2021-06-16 07:49:58 | 21.509 |
| 2021-06-16 07:50:58 | 21.509 |
| 2021-06-16 07:51:58 | 21.485 |
| 2021-06-16 07:52:58 | 21.485 |
| 2021-06-16 07:53:58 | 21.461 |
| 2021-06-16 07:54:58 | 21.461 |
| 2021-06-16 07:55:58 | 21.437 |
| 2021-06-16 07:56:58 | 21.437 |
| 2021-06-16 07:57:58 | 21.413 |
| 2021-06-16 07:58:58 | 21.413 |
| 2021-06-16 07:59:58 | 21.413 |
| 2021-06-16 08:00:58 | 21.39 |
| 2021-06-16 08:01:58 | 21.39 |
| 2021-06-16 08:02:58 | 21.366 |
| 2021-06-16 08:03:58 | 21.342 |
| 2021-06-16 08:04:58 | 21.342 |
| 2021-06-16 08:05:58 | 21.342 |
| 2021-06-16 08:06:58 | 21.318 |
| 2021-06-16 08:07:58 | 21.294 |
| 2021-06-16 08:08:58 | 21.294 |
| 2021-06-16 08:09:58 | 21.27 |
| 2021-06-16 08:10:58 | 21.27 |
| 2021-06-16 08:11:58 | 21.27 |
| 2021-06-16 08:12:58 | 21.246 |
| 2021-06-16 08:13:58 | 21.223 |
| 2021-06-16 08:14:58 | 21.223 |
| 2021-06-16 08:15:58 | 21.199 |
| 2021-06-16 08:16:58 | 21.199 |
| 2021-06-16 08:17:58 | 21.175 |
| 2021-06-16 08:18:58 | 21.175 |
| 2021-06-16 08:19:58 | 21.151 |
| 2021-06-16 08:20:58 | 21.151 |
| 2021-06-16 08:21:58 | 21.127 |
| 2021-06-16 08:22:58 | 21.103 |
| 2021-06-16 08:23:58 | 21.103 |
| 2021-06-16 08:24:58 | 21.079 |
| 2021-06-16 08:25:58 | 21.079 |
| 2021-06-16 08:26:58 | 21.056 |
| 2021-06-16 08:27:58 | 21.056 |
| 2021-06-16 08:28:58 | 21.032 |
| 2021-06-16 08:29:58 | 21.032 |
| 2021-06-16 08:30:58 | 21.032 |
| 2021-06-16 08:31:58 | 21.008 |
| 2021-06-16 08:32:58 | 20.984 |
| 2021-06-16 08:33:58 | 20.984 |
| 2021-06-16 08:34:58 | 20.984 |
| 2021-06-16 08:35:58 | 20.96 |
| 2021-06-16 08:36:58 | 20.96 |
| 2021-06-16 08:37:58 | 20.936 |
| 2021-06-16 08:38:58 | 20.936 |
| 2021-06-16 08:39:58 | 20.913 |
| 2021-06-16 08:40:58 | 20.913 |
| 2021-06-16 08:41:58 | 20.889 |
| 2021-06-16 08:42:58 | 20.889 |
| 2021-06-16 08:43:58 | 20.865 |
| 2021-06-16 08:44:58 | 20.865 |
| 2021-06-16 08:45:58 | 20.865 |
| 2021-06-16 08:46:58 | 20.841 |
| 2021-06-16 08:47:58 | 20.841 |
| 2021-06-16 08:48:58 | 20.817 |
| 2021-06-16 08:49:58 | 20.817 |
| 2021-06-16 08:50:58 | 20.793 |
| 2021-06-16 08:51:58 | 20.793 |
| 2021-06-16 08:52:58 | 20.77 |
| 2021-06-16 08:53:58 | 20.77 |
| 2021-06-16 08:54:58 | 20.746 |
| 2021-06-16 08:55:58 | 20.746 |
| 2021-06-16 08:56:58 | 20.746 |
| 2021-06-16 08:57:58 | 20.746 |
| 2021-06-16 08:58:58 | 20.722 |
| 2021-06-16 08:59:58 | 20.722 |
| 2021-06-16 09:00:58 | 20.698 |
| 2021-06-16 09:01:58 | 20.698 |
| 2021-06-16 09:02:58 | 20.698 |
| 2021-06-16 09:03:58 | 20.674 |
| 2021-06-16 09:04:58 | 20.674 |
| 2021-06-16 09:05:58 | 20.65 |
| 2021-06-16 09:06:58 | 20.65 |
| 2021-06-16 09:07:58 | 20.65 |
| 2021-06-16 09:08:58 | 20.627 |
| 2021-06-16 09:09:58 | 20.627 |
| 2021-06-16 09:10:58 | 20.627 |
| 2021-06-16 09:11:58 | 20.603 |
| 2021-06-16 09:12:58 | 20.603 |
| 2021-06-16 09:13:58 | 20.603 |
| 2021-06-16 09:14:58 | 20.603 |
| 2021-06-16 09:15:58 | 20.579 |
| 2021-06-16 09:16:58 | 20.579 |
| 2021-06-16 09:17:58 | 20.555 |
| 2021-06-16 09:18:58 | 20.555 |
| 2021-06-16 09:19:58 | 20.555 |
| 2021-06-16 09:20:58 | 20.531 |
| 2021-06-16 09:21:58 | 20.531 |
| 2021-06-16 09:22:58 | 20.531 |
| 2021-06-16 09:23:58 | 20.507 |
| 2021-06-16 09:24:58 | 20.507 |
| 2021-06-16 09:25:58 | 20.507 |
| 2021-06-16 09:26:58 | 20.484 |
| 2021-06-16 09:27:58 | 20.484 |
| 2021-06-16 09:28:58 | 20.484 |
| 2021-06-16 09:29:58 | 20.484 |
| 2021-06-16 09:30:58 | 20.46 |
| 2021-06-16 09:31:58 | 20.46 |
| 2021-06-16 09:32:58 | 20.436 |
| 2021-06-16 09:33:58 | 20.436 |
| 2021-06-16 09:34:58 | 20.436 |
| 2021-06-16 09:35:58 | 20.412 |
| 2021-06-16 09:36:58 | 20.412 |
| 2021-06-16 09:37:58 | 20.412 |
| 2021-06-16 09:38:58 | 20.412 |
| 2021-06-16 09:39:58 | 20.412 |
| 2021-06-16 09:40:58 | 20.388 |
| 2021-06-16 09:41:58 | 20.388 |
| 2021-06-16 09:42:58 | 20.388 |
| 2021-06-16 09:43:58 | 20.365 |
| 2021-06-16 09:44:58 | 20.365 |
| 2021-06-16 09:45:58 | 20.365 |
| 2021-06-16 09:46:58 | 20.365 |
| 2021-06-16 09:47:58 | 20.341 |
| 2021-06-16 09:48:58 | 20.341 |
| 2021-06-16 09:49:58 | 20.341 |
| 2021-06-16 09:50:58 | 20.317 |
| 2021-06-16 09:51:58 | 20.317 |
| 2021-06-16 09:52:58 | 20.317 |
| 2021-06-16 09:53:58 | 20.317 |
| 2021-06-16 09:54:58 | 20.317 |
| 2021-06-16 09:55:58 | 20.317 |
| 2021-06-16 09:56:58 | 20.317 |
| 2021-06-16 09:57:58 | 20.293 |
| 2021-06-16 09:58:58 | 20.293 |
| 2021-06-16 09:59:58 | 20.293 |
| 2021-06-16 10:00:58 | 20.293 |
| 2021-06-16 10:01:58 | 20.269 |
| 2021-06-16 10:02:58 | 20.269 |
| 2021-06-16 10:03:58 | 20.269 |
| 2021-06-16 10:04:58 | 20.269 |
| 2021-06-16 10:05:58 | 20.269 |
| 2021-06-16 10:06:58 | 20.269 |
| 2021-06-16 10:07:58 | 20.269 |
| 2021-06-16 10:08:58 | 20.246 |
| 2021-06-16 10:09:58 | 20.246 |
| 2021-06-16 10:10:58 | 20.246 |
| 2021-06-16 10:11:58 | 20.246 |
| 2021-06-16 10:12:58 | 20.246 |
| 2021-06-16 10:13:58 | 20.246 |
| 2021-06-16 10:14:58 | 20.246 |
| 2021-06-16 10:15:58 | 20.222 |
| 2021-06-16 10:16:58 | 20.246 |
| 2021-06-16 10:17:58 | 20.222 |
| 2021-06-16 10:18:58 | 20.222 |
| 2021-06-16 10:19:58 | 20.222 |
| 2021-06-16 10:20:58 | 20.222 |
| 2021-06-16 10:21:58 | 20.222 |
| 2021-06-16 10:22:58 | 20.222 |
| 2021-06-16 10:23:58 | 20.222 |
| 2021-06-16 10:24:58 | 20.198 |
| 2021-06-16 10:25:58 | 20.198 |
| 2021-06-16 10:26:58 | 20.198 |
| 2021-06-16 10:27:58 | 20.198 |
| 2021-06-16 10:28:58 | 20.198 |
| 2021-06-16 10:29:58 | 20.198 |
| 2021-06-16 10:30:58 | 20.198 |
| 2021-06-16 10:31:58 | 20.198 |
| 2021-06-16 10:32:58 | 20.198 |
| 2021-06-16 10:33:58 | 20.198 |
| 2021-06-16 10:34:58 | 20.198 |
| 2021-06-16 10:35:58 | 20.174 |
| 2021-06-16 10:36:58 | 20.174 |
| 2021-06-16 10:37:58 | 20.174 |
| 2021-06-16 10:38:58 | 20.174 |
| 2021-06-16 10:39:58 | 20.174 |
| 2021-06-16 10:40:58 | 20.174 |
| 2021-06-16 10:41:58 | 20.174 |
| 2021-06-16 10:42:58 | 20.174 |
| 2021-06-16 10:43:58 | 20.174 |
| 2021-06-16 10:44:58 | 20.174 |
| 2021-06-16 10:45:58 | 20.174 |
| 2021-06-16 10:46:58 | 20.174 |
| 2021-06-16 10:47:58 | 20.174 |
| 2021-06-16 10:48:58 | 20.15 |
| 2021-06-16 10:49:58 | 20.174 |
| 2021-06-16 10:50:58 | 20.15 |
| 2021-06-16 10:51:58 | 20.15 |
| 2021-06-16 10:52:58 | 20.15 |
| 2021-06-16 10:53:58 | 20.15 |
| 2021-06-16 10:54:58 | 20.15 |
| 2021-06-16 10:55:58 | 20.15 |
| 2021-06-16 10:56:58 | 20.15 |
| 2021-06-16 10:57:58 | 20.15 |
| 2021-06-16 10:58:58 | 20.126 |
| 2021-06-16 10:59:58 | 20.126 |
| 2021-06-16 11:00:58 | 20.15 |
| 2021-06-16 11:01:58 | 20.15 |
| 2021-06-16 11:02:58 | 20.126 |
| 2021-06-16 11:03:58 | 20.126 |
| 2021-06-16 11:04:58 | 20.126 |
| 2021-06-16 11:05:58 | 20.126 |
| 2021-06-16 11:06:58 | 20.126 |
| 2021-06-16 11:07:58 | 20.126 |
| 2021-06-16 11:08:58 | 20.126 |
| 2021-06-16 11:09:58 | 20.126 |
| 2021-06-16 11:10:58 | 20.126 |
| 2021-06-16 11:11:58 | 20.126 |
| 2021-06-16 11:12:58 | 20.126 |
| 2021-06-16 11:13:58 | 20.126 |
| 2021-06-16 11:14:58 | 20.126 |
| 2021-06-16 11:15:58 | 20.126 |
| 2021-06-16 11:16:58 | 20.126 |
| 2021-06-16 11:17:58 | 20.103 |
| 2021-06-16 11:18:58 | 20.103 |
| 2021-06-16 11:19:58 | 20.103 |
| 2021-06-16 11:20:58 | 20.103 |
| 2021-06-16 11:21:58 | 20.103 |
| 2021-06-16 11:22:58 | 20.103 |
| 2021-06-16 11:23:58 | 20.103 |
| 2021-06-16 11:24:58 | 20.103 |
| 2021-06-16 11:25:58 | 20.103 |
| 2021-06-16 11:26:58 | 20.103 |
| 2021-06-16 11:27:58 | 20.103 |
| 2021-06-16 11:28:58 | 20.103 |
| 2021-06-16 11:29:58 | 20.103 |
| 2021-06-16 11:30:58 | 20.103 |
| 2021-06-16 11:31:58 | 20.103 |
| 2021-06-16 11:32:58 | 20.103 |
| 2021-06-16 11:33:58 | 20.103 |
| 2021-06-16 11:34:58 | 20.103 |
| 2021-06-16 11:35:58 | 20.079 |
| 2021-06-16 11:36:58 | 20.079 |
| 2021-06-16 11:37:58 | 20.079 |
| 2021-06-16 11:38:58 | 20.079 |
| 2021-06-16 11:39:58 | 20.079 |
| 2021-06-16 11:40:58 | 20.079 |
| 2021-06-16 11:41:58 | 20.079 |
| 2021-06-16 11:42:58 | 20.103 |
| 2021-06-16 11:43:58 | 20.126 |
| 2021-06-16 11:44:58 | 20.15 |
| 2021-06-16 11:45:58 | 20.198 |
| 2021-06-16 11:46:58 | 20.222 |
| 2021-06-16 11:47:58 | 20.269 |
| 2021-06-16 11:48:58 | 20.293 |
| 2021-06-16 11:49:58 | 20.341 |
| 2021-06-16 11:50:58 | 20.365 |
| 2021-06-16 11:51:58 | 20.388 |
| 2021-06-16 11:52:58 | 20.412 |
| 2021-06-16 11:53:58 | 20.412 |
| 2021-06-16 11:54:58 | 20.412 |
| 2021-06-16 11:55:58 | 20.412 |
| 2021-06-16 11:56:58 | 20.412 |
| 2021-06-16 11:57:58 | 20.412 |
| 2021-06-16 11:58:58 | 20.412 |
| 2021-06-16 11:59:58 | 20.412 |
| 2021-06-16 12:00:58 | 20.412 |
| 2021-06-16 12:01:58 | 20.388 |
| 2021-06-16 12:02:58 | 20.388 |
| 2021-06-16 12:03:58 | 20.365 |
| 2021-06-16 12:04:58 | 20.365 |
| 2021-06-16 12:05:58 | 20.365 |
| 2021-06-16 12:06:58 | 20.365 |
| 2021-06-16 12:07:58 | 20.341 |
| 2021-06-16 12:08:58 | 20.341 |
| 2021-06-16 12:09:58 | 20.341 |
| 2021-06-16 12:10:58 | 20.341 |
| 2021-06-16 12:11:58 | 20.317 |
| 2021-06-16 12:12:58 | 20.317 |
| 2021-06-16 12:13:58 | 20.293 |
| 2021-06-16 12:14:58 | 20.293 |
| 2021-06-16 12:15:58 | 20.293 |
| 2021-06-16 12:16:58 | 20.293 |
| 2021-06-16 12:17:58 | 20.269 |
| 2021-06-16 12:18:58 | 20.269 |
| 2021-06-16 12:19:58 | 20.269 |
| 2021-06-16 12:20:58 | 20.246 |
| 2021-06-16 12:21:58 | 20.246 |
| 2021-06-16 12:22:58 | 20.246 |
| 2021-06-16 12:23:58 | 20.246 |
| 2021-06-16 12:24:58 | 20.222 |
| 2021-06-16 12:25:58 | 20.222 |
| 2021-06-16 12:26:58 | 20.222 |
| 2021-06-16 12:27:58 | 20.222 |
| 2021-06-16 12:28:58 | 20.222 |
| 2021-06-16 12:29:58 | 20.198 |
| 2021-06-16 12:30:58 | 20.198 |